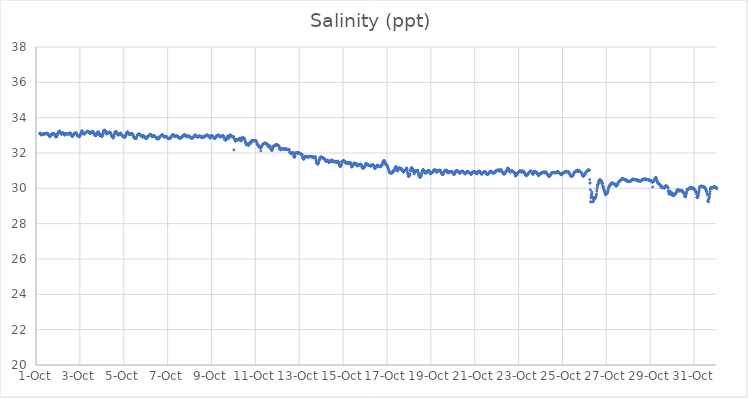
| Category | Salinity (ppt) |
|---|---|
| 44470.166666666664 | 33.1 |
| 44470.177083333336 | 33.11 |
| 44470.1875 | 33.12 |
| 44470.197916666664 | 33.13 |
| 44470.208333333336 | 33.09 |
| 44470.21875 | 33.04 |
| 44470.229166666664 | 33.02 |
| 44470.239583333336 | 33.02 |
| 44470.25 | 33.04 |
| 44470.260416666664 | 33.05 |
| 44470.270833333336 | 33.05 |
| 44470.28125 | 33.06 |
| 44470.291666666664 | 33.06 |
| 44470.302083333336 | 33.07 |
| 44470.3125 | 33.07 |
| 44470.322916666664 | 33.07 |
| 44470.333333333336 | 33.08 |
| 44470.34375 | 33.08 |
| 44470.354166666664 | 33.08 |
| 44470.364583333336 | 33.07 |
| 44470.375 | 33.08 |
| 44470.385416666664 | 33.08 |
| 44470.395833333336 | 33.09 |
| 44470.40625 | 33.1 |
| 44470.416666666664 | 33.09 |
| 44470.427083333336 | 33.1 |
| 44470.4375 | 33.1 |
| 44470.447916666664 | 33.09 |
| 44470.458333333336 | 33.1 |
| 44470.46875 | 33.08 |
| 44470.479166666664 | 33.12 |
| 44470.489583333336 | 33.11 |
| 44470.5 | 33.11 |
| 44470.510416666664 | 33.1 |
| 44470.520833333336 | 33.12 |
| 44470.53125 | 33.11 |
| 44470.541666666664 | 33.05 |
| 44470.552083333336 | 33.05 |
| 44470.5625 | 33.07 |
| 44470.572916666664 | 33.01 |
| 44470.583333333336 | 33 |
| 44470.59375 | 32.97 |
| 44470.604166666664 | 32.98 |
| 44470.614583333336 | 32.96 |
| 44470.625 | 32.92 |
| 44470.635416666664 | 32.99 |
| 44470.645833333336 | 32.96 |
| 44470.65625 | 33 |
| 44470.666666666664 | 32.96 |
| 44470.677083333336 | 32.96 |
| 44470.6875 | 33 |
| 44470.697916666664 | 33.03 |
| 44470.708333333336 | 33.06 |
| 44470.71875 | 33.08 |
| 44470.729166666664 | 33.04 |
| 44470.739583333336 | 33.05 |
| 44470.75 | 33.08 |
| 44470.760416666664 | 33.09 |
| 44470.770833333336 | 33.08 |
| 44470.78125 | 33.09 |
| 44470.791666666664 | 33.1 |
| 44470.802083333336 | 33.12 |
| 44470.8125 | 33.11 |
| 44470.822916666664 | 33.11 |
| 44470.833333333336 | 33.09 |
| 44470.84375 | 33.05 |
| 44470.854166666664 | 33.04 |
| 44470.864583333336 | 32.99 |
| 44470.875 | 32.97 |
| 44470.885416666664 | 32.94 |
| 44470.895833333336 | 32.91 |
| 44470.90625 | 32.92 |
| 44470.916666666664 | 32.92 |
| 44470.927083333336 | 32.92 |
| 44470.9375 | 32.93 |
| 44470.947916666664 | 32.92 |
| 44470.958333333336 | 33.01 |
| 44470.96875 | 33.01 |
| 44470.979166666664 | 33.1 |
| 44470.989583333336 | 33.09 |
| 44471.0 | 33.14 |
| 44471.010416666664 | 33.13 |
| 44471.020833333336 | 33.13 |
| 44471.03125 | 33.17 |
| 44471.041666666664 | 33.21 |
| 44471.052083333336 | 33.24 |
| 44471.0625 | 33.24 |
| 44471.072916666664 | 33.2 |
| 44471.083333333336 | 33.21 |
| 44471.09375 | 33.22 |
| 44471.104166666664 | 33.2 |
| 44471.114583333336 | 33.17 |
| 44471.125 | 33.14 |
| 44471.135416666664 | 33.09 |
| 44471.145833333336 | 33.07 |
| 44471.15625 | 33.06 |
| 44471.166666666664 | 33.06 |
| 44471.177083333336 | 33.13 |
| 44471.1875 | 33.09 |
| 44471.197916666664 | 33.13 |
| 44471.208333333336 | 33.1 |
| 44471.21875 | 33.11 |
| 44471.229166666664 | 33.12 |
| 44471.239583333336 | 33.13 |
| 44471.25 | 33.14 |
| 44471.260416666664 | 33.12 |
| 44471.270833333336 | 33.09 |
| 44471.28125 | 33.04 |
| 44471.291666666664 | 33.02 |
| 44471.302083333336 | 33.02 |
| 44471.3125 | 33.03 |
| 44471.322916666664 | 33.05 |
| 44471.333333333336 | 33.07 |
| 44471.34375 | 33.08 |
| 44471.354166666664 | 33.09 |
| 44471.364583333336 | 33.1 |
| 44471.375 | 33.09 |
| 44471.385416666664 | 33.09 |
| 44471.395833333336 | 33.08 |
| 44471.40625 | 33.09 |
| 44471.416666666664 | 33.08 |
| 44471.427083333336 | 33.09 |
| 44471.4375 | 33.08 |
| 44471.447916666664 | 33.08 |
| 44471.458333333336 | 33.08 |
| 44471.46875 | 33.08 |
| 44471.479166666664 | 33.1 |
| 44471.489583333336 | 33.09 |
| 44471.5 | 33.08 |
| 44471.510416666664 | 33.1 |
| 44471.520833333336 | 33.08 |
| 44471.53125 | 33.13 |
| 44471.541666666664 | 33.1 |
| 44471.552083333336 | 33.13 |
| 44471.5625 | 33.11 |
| 44471.572916666664 | 33.14 |
| 44471.583333333336 | 33.03 |
| 44471.59375 | 33.06 |
| 44471.604166666664 | 33.02 |
| 44471.614583333336 | 33.01 |
| 44471.625 | 32.98 |
| 44471.635416666664 | 32.95 |
| 44471.645833333336 | 32.97 |
| 44471.65625 | 32.97 |
| 44471.666666666664 | 32.93 |
| 44471.677083333336 | 33.02 |
| 44471.6875 | 32.99 |
| 44471.697916666664 | 32.98 |
| 44471.708333333336 | 33.04 |
| 44471.71875 | 33.04 |
| 44471.729166666664 | 33.04 |
| 44471.739583333336 | 33.1 |
| 44471.75 | 33.09 |
| 44471.760416666664 | 33.11 |
| 44471.770833333336 | 33.13 |
| 44471.78125 | 33.13 |
| 44471.791666666664 | 33.12 |
| 44471.802083333336 | 33.12 |
| 44471.8125 | 33.14 |
| 44471.822916666664 | 33.14 |
| 44471.833333333336 | 33.12 |
| 44471.84375 | 33.12 |
| 44471.854166666664 | 33.09 |
| 44471.864583333336 | 33.06 |
| 44471.875 | 33.04 |
| 44471.885416666664 | 32.98 |
| 44471.895833333336 | 33 |
| 44471.90625 | 32.97 |
| 44471.916666666664 | 32.96 |
| 44471.927083333336 | 32.96 |
| 44471.9375 | 32.93 |
| 44471.947916666664 | 32.95 |
| 44471.958333333336 | 32.94 |
| 44471.96875 | 32.95 |
| 44471.979166666664 | 32.91 |
| 44471.989583333336 | 32.98 |
| 44472.0 | 32.95 |
| 44472.010416666664 | 32.98 |
| 44472.020833333336 | 33.03 |
| 44472.03125 | 33.06 |
| 44472.041666666664 | 33.09 |
| 44472.052083333336 | 33.06 |
| 44472.0625 | 33.17 |
| 44472.072916666664 | 33.18 |
| 44472.083333333336 | 33.25 |
| 44472.09375 | 33.25 |
| 44472.104166666664 | 33.24 |
| 44472.114583333336 | 33.24 |
| 44472.125 | 33.18 |
| 44472.135416666664 | 33.18 |
| 44472.145833333336 | 33.14 |
| 44472.15625 | 33.1 |
| 44472.166666666664 | 33.1 |
| 44472.177083333336 | 33.07 |
| 44472.1875 | 33.07 |
| 44472.197916666664 | 33.08 |
| 44472.208333333336 | 33.11 |
| 44472.21875 | 33.12 |
| 44472.229166666664 | 33.11 |
| 44472.239583333336 | 33.11 |
| 44472.25 | 33.12 |
| 44472.260416666664 | 33.12 |
| 44472.270833333336 | 33.15 |
| 44472.28125 | 33.18 |
| 44472.291666666664 | 33.17 |
| 44472.302083333336 | 33.17 |
| 44472.3125 | 33.19 |
| 44472.322916666664 | 33.19 |
| 44472.333333333336 | 33.21 |
| 44472.34375 | 33.22 |
| 44472.354166666664 | 33.24 |
| 44472.364583333336 | 33.23 |
| 44472.375 | 33.23 |
| 44472.385416666664 | 33.22 |
| 44472.395833333336 | 33.21 |
| 44472.40625 | 33.2 |
| 44472.416666666664 | 33.18 |
| 44472.427083333336 | 33.17 |
| 44472.4375 | 33.14 |
| 44472.447916666664 | 33.11 |
| 44472.458333333336 | 33.13 |
| 44472.46875 | 33.1 |
| 44472.479166666664 | 33.1 |
| 44472.489583333336 | 33.12 |
| 44472.5 | 33.14 |
| 44472.510416666664 | 33.16 |
| 44472.520833333336 | 33.2 |
| 44472.53125 | 33.17 |
| 44472.541666666664 | 33.2 |
| 44472.552083333336 | 33.21 |
| 44472.5625 | 33.18 |
| 44472.572916666664 | 33.14 |
| 44472.583333333336 | 33.23 |
| 44472.59375 | 33.18 |
| 44472.604166666664 | 33.18 |
| 44472.614583333336 | 33.18 |
| 44472.625 | 33.16 |
| 44472.635416666664 | 33.16 |
| 44472.645833333336 | 33.1 |
| 44472.65625 | 33.11 |
| 44472.666666666664 | 33.09 |
| 44472.677083333336 | 32.99 |
| 44472.6875 | 33.01 |
| 44472.697916666664 | 32.98 |
| 44472.708333333336 | 33.01 |
| 44472.71875 | 33.04 |
| 44472.729166666664 | 32.98 |
| 44472.739583333336 | 33 |
| 44472.75 | 33.01 |
| 44472.760416666664 | 33.07 |
| 44472.770833333336 | 33.08 |
| 44472.78125 | 33.1 |
| 44472.791666666664 | 33.14 |
| 44472.802083333336 | 33.16 |
| 44472.8125 | 33.18 |
| 44472.822916666664 | 33.18 |
| 44472.833333333336 | 33.19 |
| 44472.84375 | 33.19 |
| 44472.854166666664 | 33.18 |
| 44472.864583333336 | 33.17 |
| 44472.875 | 33.11 |
| 44472.885416666664 | 33.09 |
| 44472.895833333336 | 33.07 |
| 44472.90625 | 32.98 |
| 44472.916666666664 | 33.04 |
| 44472.927083333336 | 33.01 |
| 44472.9375 | 32.98 |
| 44472.947916666664 | 32.96 |
| 44472.958333333336 | 32.98 |
| 44472.96875 | 32.96 |
| 44472.979166666664 | 32.96 |
| 44472.989583333336 | 32.96 |
| 44473.0 | 33.04 |
| 44473.010416666664 | 32.97 |
| 44473.020833333336 | 32.94 |
| 44473.03125 | 32.98 |
| 44473.041666666664 | 32.99 |
| 44473.052083333336 | 33.11 |
| 44473.0625 | 33.11 |
| 44473.072916666664 | 33.19 |
| 44473.083333333336 | 33.28 |
| 44473.09375 | 33.26 |
| 44473.104166666664 | 33.26 |
| 44473.114583333336 | 33.29 |
| 44473.125 | 33.27 |
| 44473.135416666664 | 33.29 |
| 44473.145833333336 | 33.25 |
| 44473.15625 | 33.26 |
| 44473.166666666664 | 33.24 |
| 44473.177083333336 | 33.18 |
| 44473.1875 | 33.17 |
| 44473.197916666664 | 33.13 |
| 44473.208333333336 | 33.09 |
| 44473.21875 | 33.08 |
| 44473.229166666664 | 33.09 |
| 44473.239583333336 | 33.13 |
| 44473.25 | 33.12 |
| 44473.260416666664 | 33.11 |
| 44473.270833333336 | 33.13 |
| 44473.28125 | 33.14 |
| 44473.291666666664 | 33.14 |
| 44473.302083333336 | 33.16 |
| 44473.3125 | 33.17 |
| 44473.322916666664 | 33.15 |
| 44473.333333333336 | 33.16 |
| 44473.34375 | 33.18 |
| 44473.354166666664 | 33.18 |
| 44473.364583333336 | 33.18 |
| 44473.375 | 33.16 |
| 44473.385416666664 | 33.16 |
| 44473.395833333336 | 33.16 |
| 44473.40625 | 33.13 |
| 44473.416666666664 | 33.11 |
| 44473.427083333336 | 33.04 |
| 44473.4375 | 32.99 |
| 44473.447916666664 | 32.96 |
| 44473.458333333336 | 32.93 |
| 44473.46875 | 32.94 |
| 44473.479166666664 | 32.91 |
| 44473.489583333336 | 32.91 |
| 44473.5 | 32.86 |
| 44473.510416666664 | 32.87 |
| 44473.520833333336 | 32.84 |
| 44473.53125 | 32.88 |
| 44473.541666666664 | 32.93 |
| 44473.552083333336 | 32.95 |
| 44473.5625 | 33.06 |
| 44473.572916666664 | 33.06 |
| 44473.583333333336 | 33.1 |
| 44473.59375 | 33.15 |
| 44473.604166666664 | 33.19 |
| 44473.614583333336 | 33.17 |
| 44473.625 | 33.22 |
| 44473.635416666664 | 33.21 |
| 44473.645833333336 | 33.22 |
| 44473.65625 | 33.2 |
| 44473.666666666664 | 33.18 |
| 44473.677083333336 | 33.17 |
| 44473.6875 | 33.16 |
| 44473.697916666664 | 33.11 |
| 44473.708333333336 | 33.08 |
| 44473.71875 | 33.05 |
| 44473.729166666664 | 33.04 |
| 44473.739583333336 | 33.01 |
| 44473.75 | 33.04 |
| 44473.760416666664 | 33.03 |
| 44473.770833333336 | 33.02 |
| 44473.78125 | 33.04 |
| 44473.791666666664 | 33.07 |
| 44473.802083333336 | 33.09 |
| 44473.8125 | 33.09 |
| 44473.822916666664 | 33.11 |
| 44473.833333333336 | 33.12 |
| 44473.84375 | 33.13 |
| 44473.854166666664 | 33.12 |
| 44473.864583333336 | 33.1 |
| 44473.875 | 33.09 |
| 44473.885416666664 | 33.08 |
| 44473.895833333336 | 33.05 |
| 44473.90625 | 33.02 |
| 44473.916666666664 | 32.99 |
| 44473.927083333336 | 32.98 |
| 44473.9375 | 32.97 |
| 44473.947916666664 | 32.95 |
| 44473.958333333336 | 32.93 |
| 44473.96875 | 32.91 |
| 44473.979166666664 | 32.93 |
| 44473.989583333336 | 32.93 |
| 44474.0 | 32.93 |
| 44474.010416666664 | 32.91 |
| 44474.020833333336 | 32.96 |
| 44474.03125 | 32.92 |
| 44474.041666666664 | 32.9 |
| 44474.052083333336 | 32.91 |
| 44474.0625 | 32.89 |
| 44474.072916666664 | 32.93 |
| 44474.083333333336 | 32.99 |
| 44474.09375 | 33.01 |
| 44474.104166666664 | 33.04 |
| 44474.114583333336 | 33.07 |
| 44474.125 | 33.11 |
| 44474.135416666664 | 33.15 |
| 44474.145833333336 | 33.18 |
| 44474.15625 | 33.17 |
| 44474.166666666664 | 33.2 |
| 44474.177083333336 | 33.14 |
| 44474.1875 | 33.18 |
| 44474.197916666664 | 33.16 |
| 44474.208333333336 | 33.15 |
| 44474.21875 | 33.12 |
| 44474.229166666664 | 33.1 |
| 44474.239583333336 | 33.08 |
| 44474.25 | 33.05 |
| 44474.260416666664 | 33.05 |
| 44474.270833333336 | 33.09 |
| 44474.28125 | 33.04 |
| 44474.291666666664 | 33.06 |
| 44474.302083333336 | 33.07 |
| 44474.3125 | 33.08 |
| 44474.322916666664 | 33.09 |
| 44474.333333333336 | 33.09 |
| 44474.34375 | 33.07 |
| 44474.354166666664 | 33.09 |
| 44474.364583333336 | 33.1 |
| 44474.375 | 33.11 |
| 44474.385416666664 | 33.1 |
| 44474.395833333336 | 33.08 |
| 44474.40625 | 33.06 |
| 44474.416666666664 | 33.04 |
| 44474.427083333336 | 32.99 |
| 44474.4375 | 32.95 |
| 44474.447916666664 | 32.91 |
| 44474.458333333336 | 32.9 |
| 44474.46875 | 32.85 |
| 44474.479166666664 | 32.85 |
| 44474.489583333336 | 32.85 |
| 44474.5 | 32.84 |
| 44474.510416666664 | 32.83 |
| 44474.520833333336 | 32.83 |
| 44474.53125 | 32.83 |
| 44474.541666666664 | 32.81 |
| 44474.552083333336 | 32.86 |
| 44474.5625 | 32.81 |
| 44474.572916666664 | 32.85 |
| 44474.583333333336 | 32.9 |
| 44474.59375 | 32.91 |
| 44474.604166666664 | 32.95 |
| 44474.614583333336 | 33.01 |
| 44474.625 | 33.03 |
| 44474.635416666664 | 33.03 |
| 44474.645833333336 | 33.05 |
| 44474.65625 | 33.04 |
| 44474.666666666664 | 33.05 |
| 44474.677083333336 | 33.06 |
| 44474.6875 | 33.08 |
| 44474.697916666664 | 33.07 |
| 44474.708333333336 | 33.07 |
| 44474.71875 | 33.05 |
| 44474.729166666664 | 33.06 |
| 44474.739583333336 | 33.03 |
| 44474.75 | 33.04 |
| 44474.760416666664 | 33.01 |
| 44474.770833333336 | 32.99 |
| 44474.78125 | 32.99 |
| 44474.791666666664 | 32.95 |
| 44474.802083333336 | 32.95 |
| 44474.8125 | 32.98 |
| 44474.822916666664 | 32.99 |
| 44474.833333333336 | 32.98 |
| 44474.84375 | 32.99 |
| 44474.854166666664 | 32.98 |
| 44474.864583333336 | 32.89 |
| 44474.875 | 32.99 |
| 44474.885416666664 | 32.99 |
| 44474.895833333336 | 32.98 |
| 44474.90625 | 32.98 |
| 44474.916666666664 | 32.97 |
| 44474.927083333336 | 32.95 |
| 44474.9375 | 32.92 |
| 44474.947916666664 | 32.89 |
| 44474.958333333336 | 32.88 |
| 44474.96875 | 32.86 |
| 44474.979166666664 | 32.85 |
| 44474.989583333336 | 32.83 |
| 44475.0 | 32.83 |
| 44475.010416666664 | 32.82 |
| 44475.020833333336 | 32.83 |
| 44475.03125 | 32.82 |
| 44475.041666666664 | 32.92 |
| 44475.052083333336 | 32.84 |
| 44475.0625 | 32.86 |
| 44475.072916666664 | 32.86 |
| 44475.083333333336 | 32.87 |
| 44475.09375 | 32.91 |
| 44475.104166666664 | 32.92 |
| 44475.114583333336 | 32.93 |
| 44475.125 | 32.96 |
| 44475.135416666664 | 32.99 |
| 44475.145833333336 | 32.99 |
| 44475.15625 | 33 |
| 44475.166666666664 | 33.01 |
| 44475.177083333336 | 33.04 |
| 44475.1875 | 33.05 |
| 44475.197916666664 | 33.04 |
| 44475.208333333336 | 33.05 |
| 44475.21875 | 33.06 |
| 44475.229166666664 | 33.05 |
| 44475.239583333336 | 33.04 |
| 44475.25 | 33.02 |
| 44475.260416666664 | 33.01 |
| 44475.270833333336 | 32.97 |
| 44475.28125 | 32.95 |
| 44475.291666666664 | 32.94 |
| 44475.302083333336 | 32.93 |
| 44475.3125 | 32.95 |
| 44475.322916666664 | 32.93 |
| 44475.333333333336 | 32.95 |
| 44475.34375 | 32.97 |
| 44475.354166666664 | 32.98 |
| 44475.364583333336 | 32.98 |
| 44475.375 | 32.97 |
| 44475.385416666664 | 32.98 |
| 44475.395833333336 | 32.98 |
| 44475.40625 | 32.97 |
| 44475.416666666664 | 32.95 |
| 44475.427083333336 | 32.95 |
| 44475.4375 | 32.94 |
| 44475.447916666664 | 32.92 |
| 44475.458333333336 | 32.89 |
| 44475.46875 | 32.87 |
| 44475.479166666664 | 32.85 |
| 44475.489583333336 | 32.83 |
| 44475.5 | 32.82 |
| 44475.510416666664 | 32.81 |
| 44475.520833333336 | 32.8 |
| 44475.53125 | 32.8 |
| 44475.541666666664 | 32.8 |
| 44475.552083333336 | 32.81 |
| 44475.5625 | 32.81 |
| 44475.572916666664 | 32.89 |
| 44475.583333333336 | 32.81 |
| 44475.59375 | 32.81 |
| 44475.604166666664 | 32.84 |
| 44475.614583333336 | 32.84 |
| 44475.625 | 32.88 |
| 44475.635416666664 | 32.9 |
| 44475.645833333336 | 32.92 |
| 44475.65625 | 32.94 |
| 44475.666666666664 | 32.95 |
| 44475.677083333336 | 32.95 |
| 44475.6875 | 32.97 |
| 44475.697916666664 | 32.98 |
| 44475.708333333336 | 33 |
| 44475.71875 | 33.01 |
| 44475.729166666664 | 33.02 |
| 44475.739583333336 | 33.03 |
| 44475.75 | 33.03 |
| 44475.760416666664 | 33 |
| 44475.770833333336 | 33.01 |
| 44475.78125 | 32.99 |
| 44475.791666666664 | 32.99 |
| 44475.802083333336 | 32.95 |
| 44475.8125 | 32.95 |
| 44475.822916666664 | 32.92 |
| 44475.833333333336 | 32.93 |
| 44475.84375 | 32.9 |
| 44475.854166666664 | 32.9 |
| 44475.864583333336 | 32.92 |
| 44475.875 | 32.93 |
| 44475.885416666664 | 32.95 |
| 44475.895833333336 | 32.94 |
| 44475.90625 | 32.93 |
| 44475.916666666664 | 32.94 |
| 44475.927083333336 | 32.95 |
| 44475.9375 | 32.94 |
| 44475.947916666664 | 32.92 |
| 44475.958333333336 | 32.9 |
| 44475.96875 | 32.9 |
| 44475.979166666664 | 32.89 |
| 44475.989583333336 | 32.87 |
| 44476.0 | 32.86 |
| 44476.010416666664 | 32.84 |
| 44476.020833333336 | 32.83 |
| 44476.03125 | 32.82 |
| 44476.041666666664 | 32.81 |
| 44476.052083333336 | 32.81 |
| 44476.0625 | 32.81 |
| 44476.072916666664 | 32.85 |
| 44476.083333333336 | 32.82 |
| 44476.09375 | 32.81 |
| 44476.104166666664 | 32.84 |
| 44476.114583333336 | 32.83 |
| 44476.125 | 32.84 |
| 44476.135416666664 | 32.85 |
| 44476.145833333336 | 32.88 |
| 44476.15625 | 32.9 |
| 44476.166666666664 | 32.93 |
| 44476.177083333336 | 32.96 |
| 44476.1875 | 32.99 |
| 44476.197916666664 | 33.01 |
| 44476.208333333336 | 32.99 |
| 44476.21875 | 33.01 |
| 44476.229166666664 | 33.02 |
| 44476.239583333336 | 33.03 |
| 44476.25 | 33.03 |
| 44476.260416666664 | 33.03 |
| 44476.270833333336 | 33.02 |
| 44476.28125 | 33 |
| 44476.291666666664 | 32.99 |
| 44476.302083333336 | 32.96 |
| 44476.3125 | 32.95 |
| 44476.322916666664 | 32.92 |
| 44476.333333333336 | 32.92 |
| 44476.34375 | 32.94 |
| 44476.354166666664 | 32.94 |
| 44476.364583333336 | 32.94 |
| 44476.375 | 32.96 |
| 44476.385416666664 | 32.97 |
| 44476.395833333336 | 32.97 |
| 44476.40625 | 32.97 |
| 44476.416666666664 | 32.96 |
| 44476.427083333336 | 32.97 |
| 44476.4375 | 32.97 |
| 44476.447916666664 | 32.94 |
| 44476.458333333336 | 32.93 |
| 44476.46875 | 32.92 |
| 44476.479166666664 | 32.91 |
| 44476.489583333336 | 32.9 |
| 44476.5 | 32.88 |
| 44476.510416666664 | 32.86 |
| 44476.520833333336 | 32.85 |
| 44476.53125 | 32.83 |
| 44476.541666666664 | 32.83 |
| 44476.552083333336 | 32.83 |
| 44476.5625 | 32.84 |
| 44476.572916666664 | 32.85 |
| 44476.583333333336 | 32.85 |
| 44476.59375 | 32.86 |
| 44476.604166666664 | 32.86 |
| 44476.614583333336 | 32.86 |
| 44476.625 | 32.86 |
| 44476.635416666664 | 32.88 |
| 44476.645833333336 | 32.9 |
| 44476.65625 | 32.92 |
| 44476.666666666664 | 32.93 |
| 44476.677083333336 | 32.93 |
| 44476.6875 | 32.94 |
| 44476.697916666664 | 32.96 |
| 44476.708333333336 | 32.98 |
| 44476.71875 | 32.97 |
| 44476.729166666664 | 33 |
| 44476.739583333336 | 33.01 |
| 44476.75 | 33.03 |
| 44476.760416666664 | 33.02 |
| 44476.770833333336 | 32.98 |
| 44476.78125 | 33.03 |
| 44476.791666666664 | 33.02 |
| 44476.802083333336 | 33.01 |
| 44476.8125 | 32.98 |
| 44476.822916666664 | 32.98 |
| 44476.833333333336 | 32.95 |
| 44476.84375 | 32.97 |
| 44476.854166666664 | 32.95 |
| 44476.864583333336 | 32.95 |
| 44476.875 | 32.92 |
| 44476.885416666664 | 32.91 |
| 44476.895833333336 | 32.92 |
| 44476.90625 | 32.94 |
| 44476.916666666664 | 32.96 |
| 44476.927083333336 | 32.96 |
| 44476.9375 | 32.95 |
| 44476.947916666664 | 32.96 |
| 44476.958333333336 | 32.97 |
| 44476.96875 | 32.97 |
| 44476.979166666664 | 32.94 |
| 44476.989583333336 | 32.93 |
| 44477.0 | 32.93 |
| 44477.010416666664 | 32.93 |
| 44477.020833333336 | 32.92 |
| 44477.03125 | 32.9 |
| 44477.041666666664 | 32.88 |
| 44477.052083333336 | 32.87 |
| 44477.0625 | 32.85 |
| 44477.072916666664 | 32.84 |
| 44477.083333333336 | 32.84 |
| 44477.09375 | 32.84 |
| 44477.104166666664 | 32.84 |
| 44477.114583333336 | 32.84 |
| 44477.125 | 32.84 |
| 44477.135416666664 | 32.84 |
| 44477.145833333336 | 32.87 |
| 44477.15625 | 32.86 |
| 44477.166666666664 | 32.89 |
| 44477.177083333336 | 32.9 |
| 44477.1875 | 32.92 |
| 44477.197916666664 | 32.93 |
| 44477.208333333336 | 32.97 |
| 44477.21875 | 32.98 |
| 44477.229166666664 | 33 |
| 44477.239583333336 | 32.93 |
| 44477.25 | 32.99 |
| 44477.260416666664 | 32.93 |
| 44477.270833333336 | 33.03 |
| 44477.28125 | 33.01 |
| 44477.291666666664 | 32.99 |
| 44477.302083333336 | 32.95 |
| 44477.3125 | 32.97 |
| 44477.322916666664 | 32.95 |
| 44477.333333333336 | 32.93 |
| 44477.34375 | 32.91 |
| 44477.354166666664 | 32.9 |
| 44477.364583333336 | 32.91 |
| 44477.375 | 32.91 |
| 44477.385416666664 | 32.9 |
| 44477.395833333336 | 32.91 |
| 44477.40625 | 32.93 |
| 44477.416666666664 | 32.95 |
| 44477.427083333336 | 32.96 |
| 44477.4375 | 32.96 |
| 44477.447916666664 | 32.96 |
| 44477.458333333336 | 32.96 |
| 44477.46875 | 32.96 |
| 44477.479166666664 | 32.95 |
| 44477.489583333336 | 32.95 |
| 44477.5 | 32.94 |
| 44477.510416666664 | 32.93 |
| 44477.520833333336 | 32.92 |
| 44477.53125 | 32.9 |
| 44477.541666666664 | 32.88 |
| 44477.552083333336 | 32.87 |
| 44477.5625 | 32.86 |
| 44477.572916666664 | 32.87 |
| 44477.583333333336 | 32.89 |
| 44477.59375 | 32.9 |
| 44477.604166666664 | 32.9 |
| 44477.614583333336 | 32.92 |
| 44477.625 | 32.92 |
| 44477.635416666664 | 32.92 |
| 44477.645833333336 | 32.91 |
| 44477.65625 | 32.9 |
| 44477.666666666664 | 32.92 |
| 44477.677083333336 | 32.92 |
| 44477.6875 | 32.92 |
| 44477.697916666664 | 32.93 |
| 44477.708333333336 | 32.94 |
| 44477.71875 | 32.98 |
| 44477.729166666664 | 32.97 |
| 44477.739583333336 | 33 |
| 44477.75 | 32.97 |
| 44477.760416666664 | 33.01 |
| 44477.770833333336 | 33 |
| 44477.78125 | 33.02 |
| 44477.791666666664 | 33.03 |
| 44477.802083333336 | 32.98 |
| 44477.8125 | 33 |
| 44477.822916666664 | 32.98 |
| 44477.833333333336 | 33.01 |
| 44477.84375 | 33 |
| 44477.854166666664 | 32.97 |
| 44477.864583333336 | 32.94 |
| 44477.875 | 32.98 |
| 44477.885416666664 | 32.94 |
| 44477.895833333336 | 32.94 |
| 44477.90625 | 32.92 |
| 44477.916666666664 | 32.9 |
| 44477.927083333336 | 32.93 |
| 44477.9375 | 32.83 |
| 44477.947916666664 | 32.96 |
| 44477.958333333336 | 32.96 |
| 44477.96875 | 32.96 |
| 44477.979166666664 | 32.96 |
| 44477.989583333336 | 32.97 |
| 44478.0 | 32.97 |
| 44478.010416666664 | 32.96 |
| 44478.020833333336 | 32.95 |
| 44478.03125 | 32.96 |
| 44478.041666666664 | 32.96 |
| 44478.052083333336 | 32.96 |
| 44478.0625 | 32.95 |
| 44478.072916666664 | 32.92 |
| 44478.083333333336 | 32.89 |
| 44478.09375 | 32.87 |
| 44478.104166666664 | 32.86 |
| 44478.114583333336 | 32.85 |
| 44478.125 | 32.83 |
| 44478.135416666664 | 32.82 |
| 44478.145833333336 | 32.87 |
| 44478.15625 | 32.83 |
| 44478.166666666664 | 32.83 |
| 44478.177083333336 | 32.84 |
| 44478.1875 | 32.86 |
| 44478.197916666664 | 32.89 |
| 44478.208333333336 | 32.92 |
| 44478.21875 | 32.95 |
| 44478.229166666664 | 32.98 |
| 44478.239583333336 | 32.98 |
| 44478.25 | 32.99 |
| 44478.260416666664 | 32.99 |
| 44478.270833333336 | 32.99 |
| 44478.28125 | 32.99 |
| 44478.291666666664 | 33.01 |
| 44478.302083333336 | 33.02 |
| 44478.3125 | 33.01 |
| 44478.322916666664 | 33.02 |
| 44478.333333333336 | 32.99 |
| 44478.34375 | 32.98 |
| 44478.354166666664 | 32.97 |
| 44478.364583333336 | 32.94 |
| 44478.375 | 32.92 |
| 44478.385416666664 | 32.92 |
| 44478.395833333336 | 32.93 |
| 44478.40625 | 32.92 |
| 44478.416666666664 | 32.91 |
| 44478.427083333336 | 32.92 |
| 44478.4375 | 32.94 |
| 44478.447916666664 | 32.95 |
| 44478.458333333336 | 32.97 |
| 44478.46875 | 32.96 |
| 44478.479166666664 | 32.96 |
| 44478.489583333336 | 32.96 |
| 44478.5 | 32.97 |
| 44478.510416666664 | 32.98 |
| 44478.520833333336 | 32.97 |
| 44478.53125 | 32.97 |
| 44478.541666666664 | 32.96 |
| 44478.552083333336 | 32.96 |
| 44478.5625 | 32.94 |
| 44478.572916666664 | 32.88 |
| 44478.583333333336 | 32.84 |
| 44478.59375 | 32.77 |
| 44478.604166666664 | 32.77 |
| 44478.614583333336 | 32.76 |
| 44478.625 | 32.73 |
| 44478.635416666664 | 32.75 |
| 44478.645833333336 | 32.72 |
| 44478.65625 | 32.73 |
| 44478.666666666664 | 32.75 |
| 44478.677083333336 | 32.77 |
| 44478.6875 | 32.83 |
| 44478.697916666664 | 32.83 |
| 44478.708333333336 | 32.87 |
| 44478.71875 | 32.9 |
| 44478.729166666664 | 32.93 |
| 44478.739583333336 | 32.96 |
| 44478.75 | 32.83 |
| 44478.760416666664 | 32.95 |
| 44478.770833333336 | 32.89 |
| 44478.78125 | 32.96 |
| 44478.791666666664 | 32.83 |
| 44478.802083333336 | 32.91 |
| 44478.8125 | 32.95 |
| 44478.822916666664 | 32.98 |
| 44478.833333333336 | 32.93 |
| 44478.84375 | 32.99 |
| 44478.854166666664 | 33.03 |
| 44478.864583333336 | 33.01 |
| 44478.875 | 33.02 |
| 44478.885416666664 | 32.99 |
| 44478.895833333336 | 32.95 |
| 44478.90625 | 32.94 |
| 44478.916666666664 | 32.96 |
| 44478.927083333336 | 32.96 |
| 44478.9375 | 32.93 |
| 44478.947916666664 | 32.94 |
| 44478.958333333336 | 32.94 |
| 44478.96875 | 32.93 |
| 44478.979166666664 | 32.93 |
| 44478.989583333336 | 32.92 |
| 44479.0 | 32.94 |
| 44479.010416666664 | 32.91 |
| 44479.020833333336 | 32.18 |
| 44479.03125 | 32.83 |
| 44479.041666666664 | 32.82 |
| 44479.052083333336 | 32.8 |
| 44479.0625 | 32.77 |
| 44479.072916666664 | 32.71 |
| 44479.083333333336 | 32.69 |
| 44479.09375 | 32.67 |
| 44479.104166666664 | 32.68 |
| 44479.114583333336 | 32.71 |
| 44479.125 | 32.77 |
| 44479.135416666664 | 32.76 |
| 44479.145833333336 | 32.76 |
| 44479.15625 | 32.76 |
| 44479.166666666664 | 32.74 |
| 44479.177083333336 | 32.76 |
| 44479.1875 | 32.75 |
| 44479.197916666664 | 32.73 |
| 44479.208333333336 | 32.75 |
| 44479.21875 | 32.74 |
| 44479.229166666664 | 32.76 |
| 44479.239583333336 | 32.78 |
| 44479.25 | 32.8 |
| 44479.260416666664 | 32.81 |
| 44479.270833333336 | 32.8 |
| 44479.28125 | 32.77 |
| 44479.291666666664 | 32.8 |
| 44479.302083333336 | 32.84 |
| 44479.3125 | 32.82 |
| 44479.322916666664 | 32.69 |
| 44479.333333333336 | 32.77 |
| 44479.34375 | 32.69 |
| 44479.354166666664 | 32.77 |
| 44479.364583333336 | 32.81 |
| 44479.375 | 32.7 |
| 44479.385416666664 | 32.81 |
| 44479.395833333336 | 32.88 |
| 44479.40625 | 32.82 |
| 44479.416666666664 | 32.84 |
| 44479.427083333336 | 32.87 |
| 44479.4375 | 32.87 |
| 44479.447916666664 | 32.84 |
| 44479.458333333336 | 32.85 |
| 44479.46875 | 32.85 |
| 44479.479166666664 | 32.84 |
| 44479.489583333336 | 32.84 |
| 44479.5 | 32.82 |
| 44479.510416666664 | 32.8 |
| 44479.520833333336 | 32.74 |
| 44479.53125 | 32.68 |
| 44479.541666666664 | 32.64 |
| 44479.552083333336 | 32.63 |
| 44479.5625 | 32.55 |
| 44479.572916666664 | 32.53 |
| 44479.583333333336 | 32.49 |
| 44479.59375 | 32.45 |
| 44479.604166666664 | 32.48 |
| 44479.614583333336 | 32.5 |
| 44479.625 | 32.51 |
| 44479.635416666664 | 32.51 |
| 44479.645833333336 | 32.52 |
| 44479.65625 | 32.51 |
| 44479.666666666664 | 32.46 |
| 44479.677083333336 | 32.46 |
| 44479.6875 | 32.43 |
| 44479.697916666664 | 32.45 |
| 44479.708333333336 | 32.46 |
| 44479.71875 | 32.53 |
| 44479.729166666664 | 32.55 |
| 44479.739583333336 | 32.56 |
| 44479.75 | 32.58 |
| 44479.760416666664 | 32.58 |
| 44479.770833333336 | 32.6 |
| 44479.78125 | 32.61 |
| 44479.791666666664 | 32.54 |
| 44479.802083333336 | 32.65 |
| 44479.8125 | 32.67 |
| 44479.822916666664 | 32.67 |
| 44479.833333333336 | 32.7 |
| 44479.84375 | 32.71 |
| 44479.854166666664 | 32.71 |
| 44479.864583333336 | 32.68 |
| 44479.875 | 32.7 |
| 44479.885416666664 | 32.7 |
| 44479.895833333336 | 32.66 |
| 44479.90625 | 32.7 |
| 44479.916666666664 | 32.69 |
| 44479.927083333336 | 32.71 |
| 44479.9375 | 32.72 |
| 44479.947916666664 | 32.71 |
| 44479.958333333336 | 32.71 |
| 44479.96875 | 32.72 |
| 44479.979166666664 | 32.7 |
| 44479.989583333336 | 32.71 |
| 44480.0 | 32.7 |
| 44480.010416666664 | 32.7 |
| 44480.020833333336 | 32.69 |
| 44480.03125 | 32.69 |
| 44480.041666666664 | 32.67 |
| 44480.052083333336 | 32.62 |
| 44480.0625 | 32.59 |
| 44480.072916666664 | 32.56 |
| 44480.083333333336 | 32.49 |
| 44480.09375 | 32.46 |
| 44480.104166666664 | 32.46 |
| 44480.114583333336 | 32.47 |
| 44480.125 | 32.46 |
| 44480.135416666664 | 32.43 |
| 44480.145833333336 | 32.39 |
| 44480.15625 | 32.37 |
| 44480.166666666664 | 32.35 |
| 44480.177083333336 | 32.34 |
| 44480.1875 | 32.33 |
| 44480.197916666664 | 32.31 |
| 44480.208333333336 | 32.3 |
| 44480.21875 | 32.29 |
| 44480.229166666664 | 32.29 |
| 44480.239583333336 | 32.28 |
| 44480.25 | 32.12 |
| 44480.260416666664 | 32.3 |
| 44480.270833333336 | 32.31 |
| 44480.28125 | 32.35 |
| 44480.291666666664 | 32.4 |
| 44480.302083333336 | 32.42 |
| 44480.3125 | 32.44 |
| 44480.322916666664 | 32.43 |
| 44480.333333333336 | 32.47 |
| 44480.34375 | 32.51 |
| 44480.354166666664 | 32.5 |
| 44480.364583333336 | 32.51 |
| 44480.375 | 32.51 |
| 44480.385416666664 | 32.55 |
| 44480.395833333336 | 32.54 |
| 44480.40625 | 32.54 |
| 44480.416666666664 | 32.55 |
| 44480.427083333336 | 32.57 |
| 44480.4375 | 32.53 |
| 44480.447916666664 | 32.53 |
| 44480.458333333336 | 32.55 |
| 44480.46875 | 32.55 |
| 44480.479166666664 | 32.53 |
| 44480.489583333336 | 32.53 |
| 44480.5 | 32.54 |
| 44480.510416666664 | 32.53 |
| 44480.520833333336 | 32.52 |
| 44480.53125 | 32.51 |
| 44480.541666666664 | 32.5 |
| 44480.552083333336 | 32.44 |
| 44480.5625 | 32.41 |
| 44480.572916666664 | 32.41 |
| 44480.583333333336 | 32.38 |
| 44480.59375 | 32.36 |
| 44480.604166666664 | 32.35 |
| 44480.614583333336 | 32.36 |
| 44480.625 | 32.37 |
| 44480.635416666664 | 32.39 |
| 44480.645833333336 | 32.4 |
| 44480.65625 | 32.41 |
| 44480.666666666664 | 32.39 |
| 44480.677083333336 | 32.35 |
| 44480.6875 | 32.31 |
| 44480.697916666664 | 32.25 |
| 44480.708333333336 | 32.21 |
| 44480.71875 | 32.17 |
| 44480.729166666664 | 32.17 |
| 44480.739583333336 | 32.16 |
| 44480.75 | 32.15 |
| 44480.760416666664 | 32.14 |
| 44480.770833333336 | 32.21 |
| 44480.78125 | 32.23 |
| 44480.791666666664 | 32.29 |
| 44480.802083333336 | 32.33 |
| 44480.8125 | 32.31 |
| 44480.822916666664 | 32.36 |
| 44480.833333333336 | 32.39 |
| 44480.84375 | 32.4 |
| 44480.854166666664 | 32.4 |
| 44480.864583333336 | 32.41 |
| 44480.875 | 32.41 |
| 44480.885416666664 | 32.42 |
| 44480.895833333336 | 32.41 |
| 44480.90625 | 32.42 |
| 44480.916666666664 | 32.44 |
| 44480.927083333336 | 32.45 |
| 44480.9375 | 32.49 |
| 44480.947916666664 | 32.47 |
| 44480.958333333336 | 32.47 |
| 44480.96875 | 32.45 |
| 44480.979166666664 | 32.46 |
| 44480.989583333336 | 32.45 |
| 44481.0 | 32.46 |
| 44481.010416666664 | 32.46 |
| 44481.020833333336 | 32.44 |
| 44481.03125 | 32.44 |
| 44481.041666666664 | 32.43 |
| 44481.052083333336 | 32.42 |
| 44481.0625 | 32.41 |
| 44481.072916666664 | 32.38 |
| 44481.083333333336 | 32.36 |
| 44481.09375 | 32.36 |
| 44481.104166666664 | 32.27 |
| 44481.114583333336 | 32.21 |
| 44481.125 | 32.21 |
| 44481.135416666664 | 32.21 |
| 44481.145833333336 | 32.19 |
| 44481.15625 | 32.18 |
| 44481.166666666664 | 32.19 |
| 44481.177083333336 | 32.2 |
| 44481.1875 | 32.21 |
| 44481.197916666664 | 32.23 |
| 44481.208333333336 | 32.24 |
| 44481.21875 | 32.24 |
| 44481.229166666664 | 32.24 |
| 44481.239583333336 | 32.26 |
| 44481.25 | 32.24 |
| 44481.260416666664 | 32.24 |
| 44481.270833333336 | 32.24 |
| 44481.28125 | 32.23 |
| 44481.291666666664 | 32.21 |
| 44481.302083333336 | 32.22 |
| 44481.3125 | 32.22 |
| 44481.322916666664 | 32.22 |
| 44481.333333333336 | 32.21 |
| 44481.34375 | 32.22 |
| 44481.354166666664 | 32.22 |
| 44481.364583333336 | 32.21 |
| 44481.375 | 32.21 |
| 44481.385416666664 | 32.23 |
| 44481.395833333336 | 32.23 |
| 44481.40625 | 32.23 |
| 44481.416666666664 | 32.22 |
| 44481.427083333336 | 32.22 |
| 44481.4375 | 32.2 |
| 44481.447916666664 | 32.2 |
| 44481.458333333336 | 32.2 |
| 44481.46875 | 32.19 |
| 44481.479166666664 | 32.2 |
| 44481.489583333336 | 32.2 |
| 44481.5 | 32.2 |
| 44481.510416666664 | 32.2 |
| 44481.520833333336 | 32.19 |
| 44481.53125 | 32.19 |
| 44481.541666666664 | 32.19 |
| 44481.552083333336 | 32.19 |
| 44481.5625 | 32.05 |
| 44481.572916666664 | 32.03 |
| 44481.583333333336 | 32.04 |
| 44481.59375 | 32.01 |
| 44481.604166666664 | 32 |
| 44481.614583333336 | 31.98 |
| 44481.625 | 31.97 |
| 44481.635416666664 | 31.97 |
| 44481.645833333336 | 31.97 |
| 44481.65625 | 31.97 |
| 44481.666666666664 | 31.99 |
| 44481.677083333336 | 32 |
| 44481.6875 | 32.02 |
| 44481.697916666664 | 32.02 |
| 44481.708333333336 | 32.04 |
| 44481.71875 | 32.03 |
| 44481.729166666664 | 31.99 |
| 44481.739583333336 | 31.9 |
| 44481.75 | 31.82 |
| 44481.760416666664 | 31.79 |
| 44481.770833333336 | 31.76 |
| 44481.78125 | 31.76 |
| 44481.791666666664 | 31.76 |
| 44481.802083333336 | 31.81 |
| 44481.8125 | 31.88 |
| 44481.822916666664 | 31.98 |
| 44481.833333333336 | 32.01 |
| 44481.84375 | 32.01 |
| 44481.854166666664 | 32.02 |
| 44481.864583333336 | 32.01 |
| 44481.875 | 32.02 |
| 44481.885416666664 | 32.02 |
| 44481.895833333336 | 32.02 |
| 44481.90625 | 32 |
| 44481.916666666664 | 32.01 |
| 44481.927083333336 | 32 |
| 44481.9375 | 32.02 |
| 44481.947916666664 | 32.01 |
| 44481.958333333336 | 32.01 |
| 44481.96875 | 32.01 |
| 44481.979166666664 | 32.01 |
| 44481.989583333336 | 32 |
| 44482.0 | 32 |
| 44482.010416666664 | 31.98 |
| 44482.020833333336 | 31.98 |
| 44482.03125 | 31.99 |
| 44482.041666666664 | 31.97 |
| 44482.052083333336 | 31.96 |
| 44482.0625 | 31.95 |
| 44482.072916666664 | 31.96 |
| 44482.083333333336 | 31.93 |
| 44482.09375 | 31.93 |
| 44482.104166666664 | 31.92 |
| 44482.114583333336 | 31.91 |
| 44482.125 | 31.9 |
| 44482.135416666664 | 31.9 |
| 44482.145833333336 | 31.81 |
| 44482.15625 | 31.72 |
| 44482.166666666664 | 31.71 |
| 44482.177083333336 | 31.69 |
| 44482.1875 | 31.66 |
| 44482.197916666664 | 31.65 |
| 44482.208333333336 | 31.65 |
| 44482.21875 | 31.67 |
| 44482.229166666664 | 31.7 |
| 44482.239583333336 | 31.74 |
| 44482.25 | 31.76 |
| 44482.260416666664 | 31.79 |
| 44482.270833333336 | 31.81 |
| 44482.28125 | 31.81 |
| 44482.291666666664 | 31.8 |
| 44482.302083333336 | 31.81 |
| 44482.3125 | 31.82 |
| 44482.322916666664 | 31.81 |
| 44482.333333333336 | 31.8 |
| 44482.34375 | 31.79 |
| 44482.354166666664 | 31.8 |
| 44482.364583333336 | 31.77 |
| 44482.375 | 31.76 |
| 44482.385416666664 | 31.76 |
| 44482.395833333336 | 31.77 |
| 44482.40625 | 31.78 |
| 44482.416666666664 | 31.78 |
| 44482.427083333336 | 31.79 |
| 44482.4375 | 31.79 |
| 44482.447916666664 | 31.78 |
| 44482.458333333336 | 31.79 |
| 44482.46875 | 31.8 |
| 44482.479166666664 | 31.8 |
| 44482.489583333336 | 31.82 |
| 44482.5 | 31.8 |
| 44482.510416666664 | 31.8 |
| 44482.520833333336 | 31.82 |
| 44482.53125 | 31.8 |
| 44482.541666666664 | 31.79 |
| 44482.552083333336 | 31.78 |
| 44482.5625 | 31.79 |
| 44482.572916666664 | 31.79 |
| 44482.583333333336 | 31.79 |
| 44482.59375 | 31.79 |
| 44482.604166666664 | 31.78 |
| 44482.614583333336 | 31.78 |
| 44482.625 | 31.79 |
| 44482.635416666664 | 31.77 |
| 44482.645833333336 | 31.74 |
| 44482.65625 | 31.76 |
| 44482.666666666664 | 31.75 |
| 44482.677083333336 | 31.74 |
| 44482.6875 | 31.74 |
| 44482.697916666664 | 31.75 |
| 44482.708333333336 | 31.77 |
| 44482.71875 | 31.78 |
| 44482.729166666664 | 31.79 |
| 44482.739583333336 | 31.75 |
| 44482.75 | 31.69 |
| 44482.760416666664 | 31.61 |
| 44482.770833333336 | 31.54 |
| 44482.78125 | 31.5 |
| 44482.791666666664 | 31.42 |
| 44482.802083333336 | 31.41 |
| 44482.8125 | 31.39 |
| 44482.822916666664 | 31.39 |
| 44482.833333333336 | 31.39 |
| 44482.84375 | 31.36 |
| 44482.854166666664 | 31.4 |
| 44482.864583333336 | 31.4 |
| 44482.875 | 31.46 |
| 44482.885416666664 | 31.45 |
| 44482.895833333336 | 31.53 |
| 44482.90625 | 31.57 |
| 44482.916666666664 | 31.62 |
| 44482.927083333336 | 31.63 |
| 44482.9375 | 31.7 |
| 44482.947916666664 | 31.76 |
| 44482.958333333336 | 31.7 |
| 44482.96875 | 31.73 |
| 44482.979166666664 | 31.78 |
| 44482.989583333336 | 31.75 |
| 44483.0 | 31.74 |
| 44483.010416666664 | 31.76 |
| 44483.020833333336 | 31.76 |
| 44483.03125 | 31.78 |
| 44483.041666666664 | 31.75 |
| 44483.052083333336 | 31.72 |
| 44483.0625 | 31.72 |
| 44483.072916666664 | 31.72 |
| 44483.083333333336 | 31.71 |
| 44483.09375 | 31.67 |
| 44483.104166666664 | 31.71 |
| 44483.114583333336 | 31.7 |
| 44483.125 | 31.7 |
| 44483.135416666664 | 31.68 |
| 44483.145833333336 | 31.68 |
| 44483.15625 | 31.67 |
| 44483.166666666664 | 31.67 |
| 44483.177083333336 | 31.65 |
| 44483.1875 | 31.61 |
| 44483.197916666664 | 31.55 |
| 44483.208333333336 | 31.53 |
| 44483.21875 | 31.54 |
| 44483.229166666664 | 31.55 |
| 44483.239583333336 | 31.55 |
| 44483.25 | 31.55 |
| 44483.260416666664 | 31.55 |
| 44483.270833333336 | 31.56 |
| 44483.28125 | 31.58 |
| 44483.291666666664 | 31.59 |
| 44483.302083333336 | 31.58 |
| 44483.3125 | 31.56 |
| 44483.322916666664 | 31.52 |
| 44483.333333333336 | 31.5 |
| 44483.34375 | 31.46 |
| 44483.354166666664 | 31.47 |
| 44483.364583333336 | 31.46 |
| 44483.375 | 31.48 |
| 44483.385416666664 | 31.5 |
| 44483.395833333336 | 31.52 |
| 44483.40625 | 31.53 |
| 44483.416666666664 | 31.52 |
| 44483.427083333336 | 31.57 |
| 44483.4375 | 31.58 |
| 44483.447916666664 | 31.59 |
| 44483.458333333336 | 31.61 |
| 44483.46875 | 31.59 |
| 44483.479166666664 | 31.56 |
| 44483.489583333336 | 31.5 |
| 44483.5 | 31.51 |
| 44483.510416666664 | 31.52 |
| 44483.520833333336 | 31.53 |
| 44483.53125 | 31.55 |
| 44483.541666666664 | 31.57 |
| 44483.552083333336 | 31.53 |
| 44483.5625 | 31.53 |
| 44483.572916666664 | 31.53 |
| 44483.583333333336 | 31.51 |
| 44483.59375 | 31.49 |
| 44483.604166666664 | 31.49 |
| 44483.614583333336 | 31.5 |
| 44483.625 | 31.51 |
| 44483.635416666664 | 31.51 |
| 44483.645833333336 | 31.51 |
| 44483.65625 | 31.52 |
| 44483.666666666664 | 31.52 |
| 44483.677083333336 | 31.51 |
| 44483.6875 | 31.48 |
| 44483.697916666664 | 31.47 |
| 44483.708333333336 | 31.48 |
| 44483.71875 | 31.49 |
| 44483.729166666664 | 31.5 |
| 44483.739583333336 | 31.5 |
| 44483.75 | 31.53 |
| 44483.760416666664 | 31.54 |
| 44483.770833333336 | 31.53 |
| 44483.78125 | 31.51 |
| 44483.791666666664 | 31.47 |
| 44483.802083333336 | 31.43 |
| 44483.8125 | 31.4 |
| 44483.822916666664 | 31.36 |
| 44483.833333333336 | 31.33 |
| 44483.84375 | 31.31 |
| 44483.854166666664 | 31.26 |
| 44483.864583333336 | 31.23 |
| 44483.875 | 31.23 |
| 44483.885416666664 | 31.25 |
| 44483.895833333336 | 31.27 |
| 44483.90625 | 31.29 |
| 44483.916666666664 | 31.32 |
| 44483.927083333336 | 31.38 |
| 44483.9375 | 31.5 |
| 44483.947916666664 | 31.5 |
| 44483.958333333336 | 31.52 |
| 44483.96875 | 31.54 |
| 44483.979166666664 | 31.54 |
| 44483.989583333336 | 31.55 |
| 44484.0 | 31.55 |
| 44484.010416666664 | 31.56 |
| 44484.020833333336 | 31.58 |
| 44484.03125 | 31.56 |
| 44484.041666666664 | 31.54 |
| 44484.052083333336 | 31.55 |
| 44484.0625 | 31.53 |
| 44484.072916666664 | 31.52 |
| 44484.083333333336 | 31.48 |
| 44484.09375 | 31.51 |
| 44484.104166666664 | 31.51 |
| 44484.114583333336 | 31.49 |
| 44484.125 | 31.42 |
| 44484.135416666664 | 31.41 |
| 44484.145833333336 | 31.46 |
| 44484.15625 | 31.47 |
| 44484.166666666664 | 31.45 |
| 44484.177083333336 | 31.44 |
| 44484.1875 | 31.44 |
| 44484.197916666664 | 31.44 |
| 44484.208333333336 | 31.46 |
| 44484.21875 | 31.45 |
| 44484.229166666664 | 31.4 |
| 44484.239583333336 | 31.39 |
| 44484.25 | 31.41 |
| 44484.260416666664 | 31.43 |
| 44484.270833333336 | 31.43 |
| 44484.28125 | 31.44 |
| 44484.291666666664 | 31.46 |
| 44484.302083333336 | 31.47 |
| 44484.3125 | 31.47 |
| 44484.322916666664 | 31.46 |
| 44484.333333333336 | 31.45 |
| 44484.34375 | 31.44 |
| 44484.354166666664 | 31.39 |
| 44484.364583333336 | 31.36 |
| 44484.375 | 31.27 |
| 44484.385416666664 | 31.22 |
| 44484.395833333336 | 31.21 |
| 44484.40625 | 31.23 |
| 44484.416666666664 | 31.22 |
| 44484.427083333336 | 31.25 |
| 44484.4375 | 31.29 |
| 44484.447916666664 | 31.33 |
| 44484.458333333336 | 31.37 |
| 44484.46875 | 31.37 |
| 44484.479166666664 | 31.4 |
| 44484.489583333336 | 31.42 |
| 44484.5 | 31.43 |
| 44484.510416666664 | 31.43 |
| 44484.520833333336 | 31.41 |
| 44484.53125 | 31.36 |
| 44484.541666666664 | 31.36 |
| 44484.552083333336 | 31.37 |
| 44484.5625 | 31.39 |
| 44484.572916666664 | 31.41 |
| 44484.583333333336 | 31.38 |
| 44484.59375 | 31.38 |
| 44484.604166666664 | 31.39 |
| 44484.614583333336 | 31.34 |
| 44484.625 | 31.33 |
| 44484.635416666664 | 31.26 |
| 44484.645833333336 | 31.27 |
| 44484.65625 | 31.33 |
| 44484.666666666664 | 31.33 |
| 44484.677083333336 | 31.31 |
| 44484.6875 | 31.33 |
| 44484.697916666664 | 31.35 |
| 44484.708333333336 | 31.35 |
| 44484.71875 | 31.34 |
| 44484.729166666664 | 31.33 |
| 44484.739583333336 | 31.32 |
| 44484.75 | 31.33 |
| 44484.760416666664 | 31.34 |
| 44484.770833333336 | 31.34 |
| 44484.78125 | 31.36 |
| 44484.791666666664 | 31.36 |
| 44484.802083333336 | 31.36 |
| 44484.8125 | 31.35 |
| 44484.822916666664 | 31.35 |
| 44484.833333333336 | 31.33 |
| 44484.84375 | 31.27 |
| 44484.854166666664 | 31.26 |
| 44484.864583333336 | 31.16 |
| 44484.875 | 31.17 |
| 44484.885416666664 | 31.15 |
| 44484.895833333336 | 31.13 |
| 44484.90625 | 31.14 |
| 44484.916666666664 | 31.14 |
| 44484.927083333336 | 31.15 |
| 44484.9375 | 31.18 |
| 44484.947916666664 | 31.18 |
| 44484.958333333336 | 31.16 |
| 44484.96875 | 31.18 |
| 44484.979166666664 | 31.25 |
| 44484.989583333336 | 31.25 |
| 44485.0 | 31.27 |
| 44485.010416666664 | 31.29 |
| 44485.020833333336 | 31.36 |
| 44485.03125 | 31.35 |
| 44485.041666666664 | 31.41 |
| 44485.052083333336 | 31.41 |
| 44485.0625 | 31.38 |
| 44485.072916666664 | 31.39 |
| 44485.083333333336 | 31.37 |
| 44485.09375 | 31.35 |
| 44485.104166666664 | 31.37 |
| 44485.114583333336 | 31.34 |
| 44485.125 | 31.34 |
| 44485.135416666664 | 31.32 |
| 44485.145833333336 | 31.31 |
| 44485.15625 | 31.31 |
| 44485.166666666664 | 31.29 |
| 44485.177083333336 | 31.28 |
| 44485.1875 | 31.31 |
| 44485.197916666664 | 31.3 |
| 44485.208333333336 | 31.29 |
| 44485.21875 | 31.29 |
| 44485.229166666664 | 31.29 |
| 44485.239583333336 | 31.3 |
| 44485.25 | 31.31 |
| 44485.260416666664 | 31.24 |
| 44485.270833333336 | 31.28 |
| 44485.28125 | 31.29 |
| 44485.291666666664 | 31.29 |
| 44485.302083333336 | 31.3 |
| 44485.3125 | 31.31 |
| 44485.322916666664 | 31.32 |
| 44485.333333333336 | 31.32 |
| 44485.34375 | 31.33 |
| 44485.354166666664 | 31.33 |
| 44485.364583333336 | 31.33 |
| 44485.375 | 31.33 |
| 44485.385416666664 | 31.31 |
| 44485.395833333336 | 31.3 |
| 44485.40625 | 31.24 |
| 44485.416666666664 | 31.21 |
| 44485.427083333336 | 31.2 |
| 44485.4375 | 31.12 |
| 44485.447916666664 | 31.13 |
| 44485.458333333336 | 31.12 |
| 44485.46875 | 31.13 |
| 44485.479166666664 | 31.19 |
| 44485.489583333336 | 31.18 |
| 44485.5 | 31.21 |
| 44485.510416666664 | 31.25 |
| 44485.520833333336 | 31.25 |
| 44485.53125 | 31.25 |
| 44485.541666666664 | 31.28 |
| 44485.552083333336 | 31.29 |
| 44485.5625 | 31.3 |
| 44485.572916666664 | 31.31 |
| 44485.583333333336 | 31.27 |
| 44485.59375 | 31.24 |
| 44485.604166666664 | 31.27 |
| 44485.614583333336 | 31.25 |
| 44485.625 | 31.27 |
| 44485.635416666664 | 31.25 |
| 44485.645833333336 | 31.23 |
| 44485.65625 | 31.25 |
| 44485.666666666664 | 31.24 |
| 44485.677083333336 | 31.24 |
| 44485.6875 | 31.22 |
| 44485.697916666664 | 31.23 |
| 44485.708333333336 | 31.23 |
| 44485.71875 | 31.23 |
| 44485.729166666664 | 31.26 |
| 44485.739583333336 | 31.29 |
| 44485.75 | 31.31 |
| 44485.760416666664 | 31.3 |
| 44485.770833333336 | 31.31 |
| 44485.78125 | 31.35 |
| 44485.791666666664 | 31.39 |
| 44485.802083333336 | 31.42 |
| 44485.8125 | 31.47 |
| 44485.822916666664 | 31.5 |
| 44485.833333333336 | 31.52 |
| 44485.84375 | 31.56 |
| 44485.854166666664 | 31.57 |
| 44485.864583333336 | 31.59 |
| 44485.875 | 31.58 |
| 44485.885416666664 | 31.57 |
| 44485.895833333336 | 31.54 |
| 44485.90625 | 31.48 |
| 44485.916666666664 | 31.46 |
| 44485.927083333336 | 31.42 |
| 44485.9375 | 31.39 |
| 44485.947916666664 | 31.33 |
| 44485.958333333336 | 31.32 |
| 44485.96875 | 31.32 |
| 44485.979166666664 | 31.35 |
| 44485.989583333336 | 31.33 |
| 44486.0 | 31.31 |
| 44486.010416666664 | 31.28 |
| 44486.020833333336 | 31.26 |
| 44486.03125 | 31.19 |
| 44486.041666666664 | 31.17 |
| 44486.052083333336 | 31.14 |
| 44486.0625 | 31.12 |
| 44486.072916666664 | 31.06 |
| 44486.083333333336 | 31.01 |
| 44486.09375 | 30.97 |
| 44486.104166666664 | 30.93 |
| 44486.114583333336 | 30.92 |
| 44486.125 | 30.88 |
| 44486.135416666664 | 30.88 |
| 44486.145833333336 | 30.87 |
| 44486.15625 | 30.88 |
| 44486.166666666664 | 30.9 |
| 44486.177083333336 | 30.87 |
| 44486.1875 | 30.85 |
| 44486.197916666664 | 30.88 |
| 44486.208333333336 | 30.91 |
| 44486.21875 | 30.86 |
| 44486.229166666664 | 30.87 |
| 44486.239583333336 | 30.89 |
| 44486.25 | 30.9 |
| 44486.260416666664 | 30.92 |
| 44486.270833333336 | 30.92 |
| 44486.28125 | 30.95 |
| 44486.291666666664 | 30.98 |
| 44486.302083333336 | 31.01 |
| 44486.3125 | 31.04 |
| 44486.322916666664 | 31.01 |
| 44486.333333333336 | 31 |
| 44486.34375 | 31 |
| 44486.354166666664 | 31.05 |
| 44486.364583333336 | 31.13 |
| 44486.375 | 31.18 |
| 44486.385416666664 | 31.21 |
| 44486.395833333336 | 31.22 |
| 44486.40625 | 31.23 |
| 44486.416666666664 | 31.23 |
| 44486.427083333336 | 31.2 |
| 44486.4375 | 31.12 |
| 44486.447916666664 | 31.1 |
| 44486.458333333336 | 31.06 |
| 44486.46875 | 31.05 |
| 44486.479166666664 | 30.99 |
| 44486.489583333336 | 30.99 |
| 44486.5 | 31.04 |
| 44486.510416666664 | 31.05 |
| 44486.520833333336 | 31.1 |
| 44486.53125 | 31.12 |
| 44486.541666666664 | 31.15 |
| 44486.552083333336 | 31.15 |
| 44486.5625 | 31.16 |
| 44486.572916666664 | 31.13 |
| 44486.583333333336 | 31.15 |
| 44486.59375 | 31.15 |
| 44486.604166666664 | 31.12 |
| 44486.614583333336 | 31.08 |
| 44486.625 | 31.12 |
| 44486.635416666664 | 31.09 |
| 44486.645833333336 | 31.08 |
| 44486.65625 | 31.13 |
| 44486.666666666664 | 31.08 |
| 44486.677083333336 | 31.02 |
| 44486.6875 | 31.05 |
| 44486.697916666664 | 31.01 |
| 44486.708333333336 | 30.96 |
| 44486.71875 | 31.02 |
| 44486.729166666664 | 30.96 |
| 44486.739583333336 | 30.97 |
| 44486.75 | 30.92 |
| 44486.760416666664 | 30.93 |
| 44486.770833333336 | 30.95 |
| 44486.78125 | 30.95 |
| 44486.791666666664 | 30.98 |
| 44486.802083333336 | 31 |
| 44486.8125 | 31 |
| 44486.822916666664 | 31.02 |
| 44486.833333333336 | 31.05 |
| 44486.84375 | 31.05 |
| 44486.854166666664 | 31.05 |
| 44486.864583333336 | 31.06 |
| 44486.875 | 31.09 |
| 44486.885416666664 | 31.12 |
| 44486.895833333336 | 31.15 |
| 44486.90625 | 31.15 |
| 44486.916666666664 | 31.12 |
| 44486.927083333336 | 31.01 |
| 44486.9375 | 30.89 |
| 44486.947916666664 | 30.85 |
| 44486.958333333336 | 30.78 |
| 44486.96875 | 30.71 |
| 44486.979166666664 | 30.67 |
| 44486.989583333336 | 30.69 |
| 44487.0 | 30.69 |
| 44487.010416666664 | 30.7 |
| 44487.020833333336 | 30.74 |
| 44487.03125 | 30.74 |
| 44487.041666666664 | 30.76 |
| 44487.052083333336 | 30.82 |
| 44487.0625 | 31.02 |
| 44487.072916666664 | 30.98 |
| 44487.083333333336 | 31.04 |
| 44487.09375 | 31.08 |
| 44487.104166666664 | 31.11 |
| 44487.114583333336 | 31.18 |
| 44487.125 | 31.1 |
| 44487.135416666664 | 31.15 |
| 44487.145833333336 | 31.14 |
| 44487.15625 | 31.09 |
| 44487.166666666664 | 31.12 |
| 44487.177083333336 | 31.07 |
| 44487.1875 | 31.06 |
| 44487.197916666664 | 30.98 |
| 44487.208333333336 | 30.96 |
| 44487.21875 | 30.99 |
| 44487.229166666664 | 30.88 |
| 44487.239583333336 | 30.86 |
| 44487.25 | 30.83 |
| 44487.260416666664 | 30.89 |
| 44487.270833333336 | 30.93 |
| 44487.28125 | 30.91 |
| 44487.291666666664 | 30.94 |
| 44487.302083333336 | 30.97 |
| 44487.3125 | 30.99 |
| 44487.322916666664 | 31 |
| 44487.333333333336 | 30.98 |
| 44487.34375 | 30.98 |
| 44487.354166666664 | 30.99 |
| 44487.364583333336 | 30.99 |
| 44487.375 | 30.99 |
| 44487.385416666664 | 31.01 |
| 44487.395833333336 | 31.02 |
| 44487.40625 | 30.99 |
| 44487.416666666664 | 30.95 |
| 44487.427083333336 | 30.87 |
| 44487.4375 | 30.81 |
| 44487.447916666664 | 30.75 |
| 44487.458333333336 | 30.73 |
| 44487.46875 | 30.71 |
| 44487.479166666664 | 30.66 |
| 44487.489583333336 | 30.64 |
| 44487.5 | 30.64 |
| 44487.510416666664 | 30.63 |
| 44487.520833333336 | 30.63 |
| 44487.53125 | 30.67 |
| 44487.541666666664 | 30.67 |
| 44487.552083333336 | 30.68 |
| 44487.5625 | 30.74 |
| 44487.572916666664 | 30.81 |
| 44487.583333333336 | 30.86 |
| 44487.59375 | 30.87 |
| 44487.604166666664 | 30.9 |
| 44487.614583333336 | 31.01 |
| 44487.625 | 31.02 |
| 44487.635416666664 | 31 |
| 44487.645833333336 | 31.07 |
| 44487.65625 | 31.04 |
| 44487.666666666664 | 31.02 |
| 44487.677083333336 | 31.03 |
| 44487.6875 | 31.01 |
| 44487.697916666664 | 31 |
| 44487.708333333336 | 30.98 |
| 44487.71875 | 30.95 |
| 44487.729166666664 | 30.86 |
| 44487.739583333336 | 30.9 |
| 44487.75 | 30.92 |
| 44487.760416666664 | 30.92 |
| 44487.770833333336 | 30.92 |
| 44487.78125 | 30.85 |
| 44487.791666666664 | 30.88 |
| 44487.802083333336 | 30.89 |
| 44487.8125 | 30.94 |
| 44487.822916666664 | 30.95 |
| 44487.833333333336 | 30.95 |
| 44487.84375 | 30.97 |
| 44487.854166666664 | 30.99 |
| 44487.864583333336 | 31.01 |
| 44487.875 | 31.01 |
| 44487.885416666664 | 31.01 |
| 44487.895833333336 | 31.01 |
| 44487.90625 | 31 |
| 44487.916666666664 | 30.99 |
| 44487.927083333336 | 30.98 |
| 44487.9375 | 30.96 |
| 44487.947916666664 | 30.91 |
| 44487.958333333336 | 30.87 |
| 44487.96875 | 30.83 |
| 44487.979166666664 | 30.83 |
| 44487.989583333336 | 30.83 |
| 44488.0 | 30.83 |
| 44488.010416666664 | 30.84 |
| 44488.020833333336 | 30.85 |
| 44488.03125 | 30.86 |
| 44488.041666666664 | 30.88 |
| 44488.052083333336 | 30.89 |
| 44488.0625 | 30.9 |
| 44488.072916666664 | 30.9 |
| 44488.083333333336 | 30.95 |
| 44488.09375 | 30.92 |
| 44488.104166666664 | 30.93 |
| 44488.114583333336 | 31 |
| 44488.125 | 31.01 |
| 44488.135416666664 | 31.04 |
| 44488.145833333336 | 31.03 |
| 44488.15625 | 31.02 |
| 44488.166666666664 | 31.03 |
| 44488.177083333336 | 31.04 |
| 44488.1875 | 31.04 |
| 44488.197916666664 | 31.04 |
| 44488.208333333336 | 31.04 |
| 44488.21875 | 31.03 |
| 44488.229166666664 | 31.02 |
| 44488.239583333336 | 30.98 |
| 44488.25 | 30.97 |
| 44488.260416666664 | 30.93 |
| 44488.270833333336 | 30.9 |
| 44488.28125 | 30.94 |
| 44488.291666666664 | 30.96 |
| 44488.302083333336 | 30.95 |
| 44488.3125 | 30.97 |
| 44488.322916666664 | 30.98 |
| 44488.333333333336 | 31 |
| 44488.34375 | 31 |
| 44488.354166666664 | 31 |
| 44488.364583333336 | 31 |
| 44488.375 | 31.01 |
| 44488.385416666664 | 31.01 |
| 44488.395833333336 | 31.01 |
| 44488.40625 | 31.03 |
| 44488.416666666664 | 31.03 |
| 44488.427083333336 | 31.02 |
| 44488.4375 | 31.01 |
| 44488.447916666664 | 30.96 |
| 44488.458333333336 | 30.91 |
| 44488.46875 | 30.89 |
| 44488.479166666664 | 30.87 |
| 44488.489583333336 | 30.84 |
| 44488.5 | 30.83 |
| 44488.510416666664 | 30.79 |
| 44488.520833333336 | 30.81 |
| 44488.53125 | 30.8 |
| 44488.541666666664 | 30.79 |
| 44488.552083333336 | 30.77 |
| 44488.5625 | 30.81 |
| 44488.572916666664 | 30.82 |
| 44488.583333333336 | 30.87 |
| 44488.59375 | 30.92 |
| 44488.604166666664 | 30.91 |
| 44488.614583333336 | 30.95 |
| 44488.625 | 30.96 |
| 44488.635416666664 | 31.02 |
| 44488.645833333336 | 30.99 |
| 44488.65625 | 31.02 |
| 44488.666666666664 | 31 |
| 44488.677083333336 | 31.02 |
| 44488.6875 | 31.02 |
| 44488.697916666664 | 31 |
| 44488.708333333336 | 31.02 |
| 44488.71875 | 31.02 |
| 44488.729166666664 | 30.91 |
| 44488.739583333336 | 30.99 |
| 44488.75 | 30.95 |
| 44488.760416666664 | 31 |
| 44488.770833333336 | 30.91 |
| 44488.78125 | 30.87 |
| 44488.791666666664 | 30.91 |
| 44488.802083333336 | 30.92 |
| 44488.8125 | 30.88 |
| 44488.822916666664 | 30.89 |
| 44488.833333333336 | 30.89 |
| 44488.84375 | 30.91 |
| 44488.854166666664 | 30.93 |
| 44488.864583333336 | 30.94 |
| 44488.875 | 30.94 |
| 44488.885416666664 | 30.94 |
| 44488.895833333336 | 30.95 |
| 44488.90625 | 30.95 |
| 44488.916666666664 | 30.94 |
| 44488.927083333336 | 30.95 |
| 44488.9375 | 30.96 |
| 44488.947916666664 | 30.95 |
| 44488.958333333336 | 30.94 |
| 44488.96875 | 30.93 |
| 44488.979166666664 | 30.91 |
| 44488.989583333336 | 30.87 |
| 44489.0 | 30.84 |
| 44489.010416666664 | 30.82 |
| 44489.020833333336 | 30.82 |
| 44489.03125 | 30.81 |
| 44489.041666666664 | 30.81 |
| 44489.052083333336 | 30.79 |
| 44489.0625 | 30.79 |
| 44489.072916666664 | 30.8 |
| 44489.083333333336 | 30.81 |
| 44489.09375 | 30.86 |
| 44489.104166666664 | 30.87 |
| 44489.114583333336 | 30.95 |
| 44489.125 | 30.95 |
| 44489.135416666664 | 30.97 |
| 44489.145833333336 | 30.96 |
| 44489.15625 | 31.02 |
| 44489.166666666664 | 30.93 |
| 44489.177083333336 | 30.96 |
| 44489.1875 | 30.97 |
| 44489.197916666664 | 30.98 |
| 44489.208333333336 | 30.99 |
| 44489.21875 | 30.99 |
| 44489.229166666664 | 30.98 |
| 44489.239583333336 | 30.96 |
| 44489.25 | 30.96 |
| 44489.260416666664 | 30.92 |
| 44489.270833333336 | 30.92 |
| 44489.28125 | 30.88 |
| 44489.291666666664 | 30.87 |
| 44489.302083333336 | 30.91 |
| 44489.3125 | 30.85 |
| 44489.322916666664 | 30.86 |
| 44489.333333333336 | 30.87 |
| 44489.34375 | 30.89 |
| 44489.354166666664 | 30.9 |
| 44489.364583333336 | 30.93 |
| 44489.375 | 30.94 |
| 44489.385416666664 | 30.95 |
| 44489.395833333336 | 30.96 |
| 44489.40625 | 30.96 |
| 44489.416666666664 | 30.96 |
| 44489.427083333336 | 30.96 |
| 44489.4375 | 30.96 |
| 44489.447916666664 | 30.97 |
| 44489.458333333336 | 30.96 |
| 44489.46875 | 30.95 |
| 44489.479166666664 | 30.95 |
| 44489.489583333336 | 30.93 |
| 44489.5 | 30.91 |
| 44489.510416666664 | 30.88 |
| 44489.520833333336 | 30.86 |
| 44489.53125 | 30.84 |
| 44489.541666666664 | 30.84 |
| 44489.552083333336 | 30.82 |
| 44489.5625 | 30.82 |
| 44489.572916666664 | 30.82 |
| 44489.583333333336 | 30.85 |
| 44489.59375 | 30.84 |
| 44489.604166666664 | 30.87 |
| 44489.614583333336 | 30.89 |
| 44489.625 | 30.92 |
| 44489.635416666664 | 30.92 |
| 44489.645833333336 | 30.94 |
| 44489.65625 | 30.94 |
| 44489.666666666664 | 30.94 |
| 44489.677083333336 | 30.97 |
| 44489.6875 | 30.97 |
| 44489.697916666664 | 30.91 |
| 44489.708333333336 | 30.92 |
| 44489.71875 | 30.92 |
| 44489.729166666664 | 30.89 |
| 44489.739583333336 | 30.91 |
| 44489.75 | 30.89 |
| 44489.760416666664 | 30.86 |
| 44489.770833333336 | 30.86 |
| 44489.78125 | 30.84 |
| 44489.791666666664 | 30.87 |
| 44489.802083333336 | 30.82 |
| 44489.8125 | 30.8 |
| 44489.822916666664 | 30.82 |
| 44489.833333333336 | 30.8 |
| 44489.84375 | 30.79 |
| 44489.854166666664 | 30.81 |
| 44489.864583333336 | 30.82 |
| 44489.875 | 30.87 |
| 44489.885416666664 | 30.89 |
| 44489.895833333336 | 30.9 |
| 44489.90625 | 30.92 |
| 44489.916666666664 | 30.92 |
| 44489.927083333336 | 30.93 |
| 44489.9375 | 30.93 |
| 44489.947916666664 | 30.93 |
| 44489.958333333336 | 30.93 |
| 44489.96875 | 30.93 |
| 44489.979166666664 | 30.94 |
| 44489.989583333336 | 30.94 |
| 44490.0 | 30.94 |
| 44490.010416666664 | 30.94 |
| 44490.020833333336 | 30.93 |
| 44490.03125 | 30.91 |
| 44490.041666666664 | 30.88 |
| 44490.052083333336 | 30.86 |
| 44490.0625 | 30.85 |
| 44490.072916666664 | 30.84 |
| 44490.083333333336 | 30.84 |
| 44490.09375 | 30.84 |
| 44490.104166666664 | 30.81 |
| 44490.114583333336 | 30.84 |
| 44490.125 | 30.9 |
| 44490.135416666664 | 30.92 |
| 44490.145833333336 | 30.96 |
| 44490.15625 | 30.96 |
| 44490.166666666664 | 30.97 |
| 44490.177083333336 | 30.95 |
| 44490.1875 | 30.97 |
| 44490.197916666664 | 30.93 |
| 44490.208333333336 | 30.96 |
| 44490.21875 | 30.96 |
| 44490.229166666664 | 30.95 |
| 44490.239583333336 | 30.95 |
| 44490.25 | 30.91 |
| 44490.260416666664 | 30.91 |
| 44490.270833333336 | 30.89 |
| 44490.28125 | 30.84 |
| 44490.291666666664 | 30.84 |
| 44490.302083333336 | 30.8 |
| 44490.3125 | 30.79 |
| 44490.322916666664 | 30.84 |
| 44490.333333333336 | 30.85 |
| 44490.34375 | 30.82 |
| 44490.354166666664 | 30.84 |
| 44490.364583333336 | 30.87 |
| 44490.375 | 30.89 |
| 44490.385416666664 | 30.9 |
| 44490.395833333336 | 30.91 |
| 44490.40625 | 30.92 |
| 44490.416666666664 | 30.92 |
| 44490.427083333336 | 30.92 |
| 44490.4375 | 30.93 |
| 44490.447916666664 | 30.94 |
| 44490.458333333336 | 30.94 |
| 44490.46875 | 30.94 |
| 44490.479166666664 | 30.95 |
| 44490.489583333336 | 30.95 |
| 44490.5 | 30.91 |
| 44490.510416666664 | 30.88 |
| 44490.520833333336 | 30.85 |
| 44490.53125 | 30.83 |
| 44490.541666666664 | 30.81 |
| 44490.552083333336 | 30.8 |
| 44490.5625 | 30.8 |
| 44490.572916666664 | 30.8 |
| 44490.583333333336 | 30.8 |
| 44490.59375 | 30.8 |
| 44490.604166666664 | 30.8 |
| 44490.614583333336 | 30.82 |
| 44490.625 | 30.83 |
| 44490.635416666664 | 30.84 |
| 44490.645833333336 | 30.86 |
| 44490.65625 | 30.87 |
| 44490.666666666664 | 30.91 |
| 44490.677083333336 | 30.92 |
| 44490.6875 | 30.94 |
| 44490.697916666664 | 30.95 |
| 44490.708333333336 | 30.93 |
| 44490.71875 | 30.98 |
| 44490.729166666664 | 30.96 |
| 44490.739583333336 | 30.92 |
| 44490.75 | 30.96 |
| 44490.760416666664 | 30.94 |
| 44490.770833333336 | 30.94 |
| 44490.78125 | 30.93 |
| 44490.791666666664 | 30.93 |
| 44490.802083333336 | 30.9 |
| 44490.8125 | 30.89 |
| 44490.822916666664 | 30.87 |
| 44490.833333333336 | 30.87 |
| 44490.84375 | 30.87 |
| 44490.854166666664 | 30.89 |
| 44490.864583333336 | 30.88 |
| 44490.875 | 30.86 |
| 44490.885416666664 | 30.86 |
| 44490.895833333336 | 30.89 |
| 44490.90625 | 30.92 |
| 44490.916666666664 | 30.94 |
| 44490.927083333336 | 30.93 |
| 44490.9375 | 30.92 |
| 44490.947916666664 | 30.94 |
| 44490.958333333336 | 30.96 |
| 44490.96875 | 30.97 |
| 44490.979166666664 | 31.01 |
| 44490.989583333336 | 31.01 |
| 44491.0 | 31.01 |
| 44491.010416666664 | 31.02 |
| 44491.020833333336 | 31.01 |
| 44491.03125 | 31 |
| 44491.041666666664 | 31.02 |
| 44491.052083333336 | 31.03 |
| 44491.0625 | 31.04 |
| 44491.072916666664 | 31.04 |
| 44491.083333333336 | 31.02 |
| 44491.09375 | 31.02 |
| 44491.104166666664 | 30.98 |
| 44491.114583333336 | 30.98 |
| 44491.125 | 30.98 |
| 44491.135416666664 | 31.01 |
| 44491.145833333336 | 31.02 |
| 44491.15625 | 31.04 |
| 44491.166666666664 | 31.04 |
| 44491.177083333336 | 31.06 |
| 44491.1875 | 31.04 |
| 44491.197916666664 | 31.06 |
| 44491.208333333336 | 30.98 |
| 44491.21875 | 30.97 |
| 44491.229166666664 | 30.98 |
| 44491.239583333336 | 30.95 |
| 44491.25 | 30.94 |
| 44491.260416666664 | 30.91 |
| 44491.270833333336 | 30.92 |
| 44491.28125 | 30.87 |
| 44491.291666666664 | 30.86 |
| 44491.302083333336 | 30.87 |
| 44491.3125 | 30.83 |
| 44491.322916666664 | 30.82 |
| 44491.333333333336 | 30.81 |
| 44491.34375 | 30.81 |
| 44491.354166666664 | 30.82 |
| 44491.364583333336 | 30.83 |
| 44491.375 | 30.83 |
| 44491.385416666664 | 30.84 |
| 44491.395833333336 | 30.88 |
| 44491.40625 | 30.92 |
| 44491.416666666664 | 30.94 |
| 44491.427083333336 | 30.95 |
| 44491.4375 | 30.96 |
| 44491.447916666664 | 30.97 |
| 44491.458333333336 | 30.99 |
| 44491.46875 | 31.03 |
| 44491.479166666664 | 31.07 |
| 44491.489583333336 | 31.12 |
| 44491.5 | 31.14 |
| 44491.510416666664 | 31.14 |
| 44491.520833333336 | 31.14 |
| 44491.53125 | 31.13 |
| 44491.541666666664 | 31.11 |
| 44491.552083333336 | 31.08 |
| 44491.5625 | 31.04 |
| 44491.572916666664 | 31.02 |
| 44491.583333333336 | 30.99 |
| 44491.59375 | 30.96 |
| 44491.604166666664 | 30.94 |
| 44491.614583333336 | 30.91 |
| 44491.625 | 30.92 |
| 44491.635416666664 | 30.94 |
| 44491.645833333336 | 30.95 |
| 44491.65625 | 30.96 |
| 44491.666666666664 | 30.99 |
| 44491.677083333336 | 30.99 |
| 44491.6875 | 31 |
| 44491.697916666664 | 31 |
| 44491.708333333336 | 30.98 |
| 44491.71875 | 30.98 |
| 44491.729166666664 | 30.96 |
| 44491.739583333336 | 30.96 |
| 44491.75 | 30.94 |
| 44491.760416666664 | 30.93 |
| 44491.770833333336 | 30.92 |
| 44491.78125 | 30.92 |
| 44491.791666666664 | 30.88 |
| 44491.802083333336 | 30.9 |
| 44491.8125 | 30.9 |
| 44491.822916666664 | 30.85 |
| 44491.833333333336 | 30.83 |
| 44491.84375 | 30.78 |
| 44491.854166666664 | 30.71 |
| 44491.864583333336 | 30.69 |
| 44491.875 | 30.77 |
| 44491.885416666664 | 30.76 |
| 44491.895833333336 | 30.73 |
| 44491.90625 | 30.75 |
| 44491.916666666664 | 30.77 |
| 44491.927083333336 | 30.79 |
| 44491.9375 | 30.85 |
| 44491.947916666664 | 30.86 |
| 44491.958333333336 | 30.88 |
| 44491.96875 | 30.89 |
| 44491.979166666664 | 30.89 |
| 44491.989583333336 | 30.9 |
| 44492.0 | 30.91 |
| 44492.010416666664 | 30.92 |
| 44492.020833333336 | 30.94 |
| 44492.03125 | 30.96 |
| 44492.041666666664 | 30.97 |
| 44492.052083333336 | 30.98 |
| 44492.0625 | 30.98 |
| 44492.072916666664 | 31 |
| 44492.083333333336 | 31.01 |
| 44492.09375 | 31 |
| 44492.104166666664 | 30.98 |
| 44492.114583333336 | 30.95 |
| 44492.125 | 30.94 |
| 44492.135416666664 | 30.91 |
| 44492.145833333336 | 30.92 |
| 44492.15625 | 30.91 |
| 44492.166666666664 | 30.95 |
| 44492.177083333336 | 30.98 |
| 44492.1875 | 30.97 |
| 44492.197916666664 | 30.96 |
| 44492.208333333336 | 30.98 |
| 44492.21875 | 30.95 |
| 44492.229166666664 | 30.94 |
| 44492.239583333336 | 30.94 |
| 44492.25 | 30.9 |
| 44492.260416666664 | 30.88 |
| 44492.270833333336 | 30.91 |
| 44492.28125 | 30.83 |
| 44492.291666666664 | 30.85 |
| 44492.302083333336 | 30.83 |
| 44492.3125 | 30.79 |
| 44492.322916666664 | 30.75 |
| 44492.333333333336 | 30.73 |
| 44492.34375 | 30.72 |
| 44492.354166666664 | 30.72 |
| 44492.364583333336 | 30.73 |
| 44492.375 | 30.77 |
| 44492.385416666664 | 30.77 |
| 44492.395833333336 | 30.76 |
| 44492.40625 | 30.76 |
| 44492.416666666664 | 30.78 |
| 44492.427083333336 | 30.81 |
| 44492.4375 | 30.82 |
| 44492.447916666664 | 30.86 |
| 44492.458333333336 | 30.88 |
| 44492.46875 | 30.9 |
| 44492.479166666664 | 30.91 |
| 44492.489583333336 | 30.91 |
| 44492.5 | 30.93 |
| 44492.510416666664 | 30.95 |
| 44492.520833333336 | 30.96 |
| 44492.53125 | 30.96 |
| 44492.541666666664 | 30.97 |
| 44492.552083333336 | 30.98 |
| 44492.5625 | 30.98 |
| 44492.572916666664 | 30.97 |
| 44492.583333333336 | 30.94 |
| 44492.59375 | 30.91 |
| 44492.604166666664 | 30.9 |
| 44492.614583333336 | 30.88 |
| 44492.625 | 30.85 |
| 44492.635416666664 | 30.82 |
| 44492.645833333336 | 30.81 |
| 44492.65625 | 30.79 |
| 44492.666666666664 | 30.81 |
| 44492.677083333336 | 30.82 |
| 44492.6875 | 30.9 |
| 44492.697916666664 | 30.93 |
| 44492.708333333336 | 30.97 |
| 44492.71875 | 30.95 |
| 44492.729166666664 | 30.94 |
| 44492.739583333336 | 30.93 |
| 44492.75 | 30.95 |
| 44492.760416666664 | 30.96 |
| 44492.770833333336 | 30.95 |
| 44492.78125 | 30.93 |
| 44492.791666666664 | 30.89 |
| 44492.802083333336 | 30.91 |
| 44492.8125 | 30.9 |
| 44492.822916666664 | 30.89 |
| 44492.833333333336 | 30.9 |
| 44492.84375 | 30.85 |
| 44492.854166666664 | 30.86 |
| 44492.864583333336 | 30.81 |
| 44492.875 | 30.78 |
| 44492.885416666664 | 30.79 |
| 44492.895833333336 | 30.74 |
| 44492.90625 | 30.72 |
| 44492.916666666664 | 30.76 |
| 44492.927083333336 | 30.78 |
| 44492.9375 | 30.74 |
| 44492.947916666664 | 30.76 |
| 44492.958333333336 | 30.79 |
| 44492.96875 | 30.8 |
| 44492.979166666664 | 30.84 |
| 44492.989583333336 | 30.84 |
| 44493.0 | 30.84 |
| 44493.010416666664 | 30.85 |
| 44493.020833333336 | 30.86 |
| 44493.03125 | 30.86 |
| 44493.041666666664 | 30.86 |
| 44493.052083333336 | 30.87 |
| 44493.0625 | 30.87 |
| 44493.072916666664 | 30.88 |
| 44493.083333333336 | 30.89 |
| 44493.09375 | 30.9 |
| 44493.104166666664 | 30.91 |
| 44493.114583333336 | 30.91 |
| 44493.125 | 30.91 |
| 44493.135416666664 | 30.91 |
| 44493.145833333336 | 30.91 |
| 44493.15625 | 30.91 |
| 44493.166666666664 | 30.87 |
| 44493.177083333336 | 30.9 |
| 44493.1875 | 30.89 |
| 44493.197916666664 | 30.88 |
| 44493.208333333336 | 30.91 |
| 44493.21875 | 30.95 |
| 44493.229166666664 | 30.91 |
| 44493.239583333336 | 30.91 |
| 44493.25 | 30.92 |
| 44493.260416666664 | 30.91 |
| 44493.270833333336 | 30.85 |
| 44493.28125 | 30.86 |
| 44493.291666666664 | 30.84 |
| 44493.302083333336 | 30.82 |
| 44493.3125 | 30.79 |
| 44493.322916666664 | 30.79 |
| 44493.333333333336 | 30.74 |
| 44493.34375 | 30.72 |
| 44493.354166666664 | 30.7 |
| 44493.364583333336 | 30.69 |
| 44493.375 | 30.68 |
| 44493.385416666664 | 30.67 |
| 44493.395833333336 | 30.67 |
| 44493.40625 | 30.68 |
| 44493.416666666664 | 30.72 |
| 44493.427083333336 | 30.72 |
| 44493.4375 | 30.7 |
| 44493.447916666664 | 30.72 |
| 44493.458333333336 | 30.76 |
| 44493.46875 | 30.78 |
| 44493.479166666664 | 30.81 |
| 44493.489583333336 | 30.84 |
| 44493.5 | 30.85 |
| 44493.510416666664 | 30.85 |
| 44493.520833333336 | 30.86 |
| 44493.53125 | 30.88 |
| 44493.541666666664 | 30.89 |
| 44493.552083333336 | 30.9 |
| 44493.5625 | 30.91 |
| 44493.572916666664 | 30.91 |
| 44493.583333333336 | 30.91 |
| 44493.59375 | 30.9 |
| 44493.604166666664 | 30.89 |
| 44493.614583333336 | 30.88 |
| 44493.625 | 30.89 |
| 44493.635416666664 | 30.9 |
| 44493.645833333336 | 30.89 |
| 44493.65625 | 30.89 |
| 44493.666666666664 | 30.87 |
| 44493.677083333336 | 30.87 |
| 44493.6875 | 30.88 |
| 44493.697916666664 | 30.89 |
| 44493.708333333336 | 30.9 |
| 44493.71875 | 30.92 |
| 44493.729166666664 | 30.93 |
| 44493.739583333336 | 30.92 |
| 44493.75 | 30.92 |
| 44493.760416666664 | 30.91 |
| 44493.770833333336 | 30.91 |
| 44493.78125 | 30.92 |
| 44493.791666666664 | 30.93 |
| 44493.802083333336 | 30.95 |
| 44493.8125 | 30.93 |
| 44493.822916666664 | 30.89 |
| 44493.833333333336 | 30.91 |
| 44493.84375 | 30.9 |
| 44493.854166666664 | 30.89 |
| 44493.864583333336 | 30.87 |
| 44493.875 | 30.84 |
| 44493.885416666664 | 30.85 |
| 44493.895833333336 | 30.84 |
| 44493.90625 | 30.8 |
| 44493.916666666664 | 30.8 |
| 44493.927083333336 | 30.77 |
| 44493.9375 | 30.81 |
| 44493.947916666664 | 30.8 |
| 44493.958333333336 | 30.78 |
| 44493.96875 | 30.77 |
| 44493.979166666664 | 30.8 |
| 44493.989583333336 | 30.82 |
| 44494.0 | 30.85 |
| 44494.010416666664 | 30.87 |
| 44494.020833333336 | 30.87 |
| 44494.03125 | 30.87 |
| 44494.041666666664 | 30.87 |
| 44494.052083333336 | 30.88 |
| 44494.0625 | 30.89 |
| 44494.072916666664 | 30.91 |
| 44494.083333333336 | 30.91 |
| 44494.09375 | 30.92 |
| 44494.104166666664 | 30.93 |
| 44494.114583333336 | 30.94 |
| 44494.125 | 30.95 |
| 44494.135416666664 | 30.95 |
| 44494.145833333336 | 30.95 |
| 44494.15625 | 30.96 |
| 44494.166666666664 | 30.91 |
| 44494.177083333336 | 30.92 |
| 44494.1875 | 30.93 |
| 44494.197916666664 | 30.92 |
| 44494.208333333336 | 30.93 |
| 44494.21875 | 30.96 |
| 44494.229166666664 | 30.95 |
| 44494.239583333336 | 30.94 |
| 44494.25 | 30.94 |
| 44494.260416666664 | 30.94 |
| 44494.270833333336 | 30.94 |
| 44494.28125 | 30.92 |
| 44494.291666666664 | 30.89 |
| 44494.302083333336 | 30.9 |
| 44494.3125 | 30.89 |
| 44494.322916666664 | 30.82 |
| 44494.333333333336 | 30.82 |
| 44494.34375 | 30.78 |
| 44494.354166666664 | 30.75 |
| 44494.364583333336 | 30.72 |
| 44494.375 | 30.72 |
| 44494.385416666664 | 30.69 |
| 44494.395833333336 | 30.68 |
| 44494.40625 | 30.69 |
| 44494.416666666664 | 30.67 |
| 44494.427083333336 | 30.67 |
| 44494.4375 | 30.7 |
| 44494.447916666664 | 30.71 |
| 44494.458333333336 | 30.7 |
| 44494.46875 | 30.7 |
| 44494.479166666664 | 30.72 |
| 44494.489583333336 | 30.75 |
| 44494.5 | 30.79 |
| 44494.510416666664 | 30.83 |
| 44494.520833333336 | 30.88 |
| 44494.53125 | 30.91 |
| 44494.541666666664 | 30.91 |
| 44494.552083333336 | 30.92 |
| 44494.5625 | 30.92 |
| 44494.572916666664 | 30.93 |
| 44494.583333333336 | 30.93 |
| 44494.59375 | 30.94 |
| 44494.604166666664 | 30.97 |
| 44494.614583333336 | 30.97 |
| 44494.625 | 30.97 |
| 44494.635416666664 | 30.98 |
| 44494.645833333336 | 31 |
| 44494.65625 | 31 |
| 44494.666666666664 | 31.01 |
| 44494.677083333336 | 31.03 |
| 44494.6875 | 31.03 |
| 44494.697916666664 | 30.96 |
| 44494.708333333336 | 30.96 |
| 44494.71875 | 30.97 |
| 44494.729166666664 | 31 |
| 44494.739583333336 | 31 |
| 44494.75 | 31 |
| 44494.760416666664 | 30.96 |
| 44494.770833333336 | 30.99 |
| 44494.78125 | 30.97 |
| 44494.791666666664 | 30.96 |
| 44494.802083333336 | 30.96 |
| 44494.8125 | 30.96 |
| 44494.822916666664 | 30.94 |
| 44494.833333333336 | 30.92 |
| 44494.84375 | 30.89 |
| 44494.854166666664 | 30.89 |
| 44494.864583333336 | 30.88 |
| 44494.875 | 30.89 |
| 44494.885416666664 | 30.85 |
| 44494.895833333336 | 30.81 |
| 44494.90625 | 30.74 |
| 44494.916666666664 | 30.72 |
| 44494.927083333336 | 30.71 |
| 44494.9375 | 30.69 |
| 44494.947916666664 | 30.69 |
| 44494.958333333336 | 30.68 |
| 44494.96875 | 30.69 |
| 44494.979166666664 | 30.73 |
| 44494.989583333336 | 30.74 |
| 44495.0 | 30.74 |
| 44495.010416666664 | 30.75 |
| 44495.020833333336 | 30.78 |
| 44495.03125 | 30.83 |
| 44495.041666666664 | 30.85 |
| 44495.052083333336 | 30.87 |
| 44495.0625 | 30.9 |
| 44495.072916666664 | 30.91 |
| 44495.083333333336 | 30.92 |
| 44495.09375 | 30.93 |
| 44495.104166666664 | 30.95 |
| 44495.114583333336 | 30.97 |
| 44495.125 | 30.98 |
| 44495.135416666664 | 31 |
| 44495.145833333336 | 31.01 |
| 44495.15625 | 31.02 |
| 44495.166666666664 | 31.03 |
| 44495.177083333336 | 31.05 |
| 44495.1875 | 31.05 |
| 44495.197916666664 | 31.05 |
| 44495.208333333336 | 31.01 |
| 44495.21875 | 31.01 |
| 44495.229166666664 | 31.02 |
| 44495.239583333336 | 30.49 |
| 44495.25 | 30.29 |
| 44495.260416666664 | 30.31 |
| 44495.270833333336 | 29.92 |
| 44495.28125 | 29.24 |
| 44495.291666666664 | 29.47 |
| 44495.302083333336 | 29.23 |
| 44495.3125 | 29.6 |
| 44495.322916666664 | 29.67 |
| 44495.333333333336 | 29.8 |
| 44495.34375 | 29.72 |
| 44495.354166666664 | 29.51 |
| 44495.364583333336 | 29.53 |
| 44495.375 | 29.48 |
| 44495.385416666664 | 29.41 |
| 44495.395833333336 | 29.22 |
| 44495.40625 | 29.27 |
| 44495.416666666664 | 29.38 |
| 44495.427083333336 | 29.42 |
| 44495.4375 | 29.35 |
| 44495.447916666664 | 29.38 |
| 44495.458333333336 | 29.4 |
| 44495.46875 | 29.43 |
| 44495.479166666664 | 29.47 |
| 44495.489583333336 | 29.48 |
| 44495.5 | 29.48 |
| 44495.510416666664 | 29.46 |
| 44495.520833333336 | 29.5 |
| 44495.53125 | 29.57 |
| 44495.541666666664 | 29.63 |
| 44495.552083333336 | 29.67 |
| 44495.5625 | 29.84 |
| 44495.572916666664 | 29.96 |
| 44495.583333333336 | 30.03 |
| 44495.59375 | 30.12 |
| 44495.604166666664 | 30.18 |
| 44495.614583333336 | 30.2 |
| 44495.625 | 30.23 |
| 44495.635416666664 | 30.28 |
| 44495.645833333336 | 30.33 |
| 44495.65625 | 30.4 |
| 44495.666666666664 | 30.42 |
| 44495.677083333336 | 30.45 |
| 44495.6875 | 30.47 |
| 44495.697916666664 | 30.49 |
| 44495.708333333336 | 30.5 |
| 44495.71875 | 30.49 |
| 44495.729166666664 | 30.4 |
| 44495.739583333336 | 30.44 |
| 44495.75 | 30.44 |
| 44495.760416666664 | 30.44 |
| 44495.770833333336 | 30.43 |
| 44495.78125 | 30.4 |
| 44495.791666666664 | 30.31 |
| 44495.802083333336 | 30.27 |
| 44495.8125 | 30.29 |
| 44495.822916666664 | 30.3 |
| 44495.833333333336 | 30.29 |
| 44495.84375 | 30.15 |
| 44495.854166666664 | 30.1 |
| 44495.864583333336 | 30.06 |
| 44495.875 | 30.02 |
| 44495.885416666664 | 29.95 |
| 44495.895833333336 | 29.92 |
| 44495.90625 | 29.9 |
| 44495.916666666664 | 29.85 |
| 44495.927083333336 | 29.8 |
| 44495.9375 | 29.76 |
| 44495.947916666664 | 29.7 |
| 44495.958333333336 | 29.65 |
| 44495.96875 | 29.63 |
| 44495.979166666664 | 29.64 |
| 44495.989583333336 | 29.69 |
| 44496.0 | 29.74 |
| 44496.010416666664 | 29.72 |
| 44496.020833333336 | 29.71 |
| 44496.03125 | 29.72 |
| 44496.041666666664 | 29.73 |
| 44496.052083333336 | 29.75 |
| 44496.0625 | 29.8 |
| 44496.072916666664 | 29.84 |
| 44496.083333333336 | 29.9 |
| 44496.09375 | 29.97 |
| 44496.104166666664 | 30 |
| 44496.114583333336 | 30.06 |
| 44496.125 | 30.1 |
| 44496.135416666664 | 30.11 |
| 44496.145833333336 | 30.14 |
| 44496.15625 | 30.15 |
| 44496.166666666664 | 30.19 |
| 44496.177083333336 | 30.21 |
| 44496.1875 | 30.22 |
| 44496.197916666664 | 30.23 |
| 44496.208333333336 | 30.24 |
| 44496.21875 | 30.24 |
| 44496.229166666664 | 30.22 |
| 44496.239583333336 | 30.28 |
| 44496.25 | 30.31 |
| 44496.260416666664 | 30.31 |
| 44496.270833333336 | 30.29 |
| 44496.28125 | 30.29 |
| 44496.291666666664 | 30.29 |
| 44496.302083333336 | 30.27 |
| 44496.3125 | 30.27 |
| 44496.322916666664 | 30.26 |
| 44496.333333333336 | 30.27 |
| 44496.34375 | 30.26 |
| 44496.354166666664 | 30.28 |
| 44496.364583333336 | 30.26 |
| 44496.375 | 30.24 |
| 44496.385416666664 | 30.23 |
| 44496.395833333336 | 30.22 |
| 44496.40625 | 30.21 |
| 44496.416666666664 | 30.16 |
| 44496.427083333336 | 30.14 |
| 44496.4375 | 30.15 |
| 44496.447916666664 | 30.13 |
| 44496.458333333336 | 30.13 |
| 44496.46875 | 30.16 |
| 44496.479166666664 | 30.18 |
| 44496.489583333336 | 30.18 |
| 44496.5 | 30.2 |
| 44496.510416666664 | 30.22 |
| 44496.520833333336 | 30.24 |
| 44496.53125 | 30.29 |
| 44496.541666666664 | 30.33 |
| 44496.552083333336 | 30.35 |
| 44496.5625 | 30.37 |
| 44496.572916666664 | 30.37 |
| 44496.583333333336 | 30.39 |
| 44496.59375 | 30.4 |
| 44496.604166666664 | 30.42 |
| 44496.614583333336 | 30.42 |
| 44496.625 | 30.42 |
| 44496.635416666664 | 30.43 |
| 44496.645833333336 | 30.45 |
| 44496.65625 | 30.47 |
| 44496.666666666664 | 30.49 |
| 44496.677083333336 | 30.5 |
| 44496.6875 | 30.52 |
| 44496.697916666664 | 30.52 |
| 44496.708333333336 | 30.53 |
| 44496.71875 | 30.54 |
| 44496.729166666664 | 30.54 |
| 44496.739583333336 | 30.55 |
| 44496.75 | 30.54 |
| 44496.760416666664 | 30.55 |
| 44496.770833333336 | 30.54 |
| 44496.78125 | 30.5 |
| 44496.791666666664 | 30.51 |
| 44496.802083333336 | 30.52 |
| 44496.8125 | 30.5 |
| 44496.822916666664 | 30.5 |
| 44496.833333333336 | 30.5 |
| 44496.84375 | 30.48 |
| 44496.854166666664 | 30.48 |
| 44496.864583333336 | 30.47 |
| 44496.875 | 30.5 |
| 44496.885416666664 | 30.49 |
| 44496.895833333336 | 30.49 |
| 44496.90625 | 30.48 |
| 44496.916666666664 | 30.45 |
| 44496.927083333336 | 30.44 |
| 44496.9375 | 30.41 |
| 44496.947916666664 | 30.41 |
| 44496.958333333336 | 30.4 |
| 44496.96875 | 30.4 |
| 44496.979166666664 | 30.4 |
| 44496.989583333336 | 30.4 |
| 44497.0 | 30.4 |
| 44497.010416666664 | 30.4 |
| 44497.020833333336 | 30.4 |
| 44497.03125 | 30.39 |
| 44497.041666666664 | 30.38 |
| 44497.052083333336 | 30.38 |
| 44497.0625 | 30.39 |
| 44497.072916666664 | 30.4 |
| 44497.083333333336 | 30.4 |
| 44497.09375 | 30.4 |
| 44497.104166666664 | 30.41 |
| 44497.114583333336 | 30.41 |
| 44497.125 | 30.42 |
| 44497.135416666664 | 30.43 |
| 44497.145833333336 | 30.45 |
| 44497.15625 | 30.46 |
| 44497.166666666664 | 30.48 |
| 44497.177083333336 | 30.5 |
| 44497.1875 | 30.51 |
| 44497.197916666664 | 30.51 |
| 44497.208333333336 | 30.51 |
| 44497.21875 | 30.52 |
| 44497.229166666664 | 30.52 |
| 44497.239583333336 | 30.52 |
| 44497.25 | 30.48 |
| 44497.260416666664 | 30.51 |
| 44497.270833333336 | 30.5 |
| 44497.28125 | 30.5 |
| 44497.291666666664 | 30.5 |
| 44497.302083333336 | 30.5 |
| 44497.3125 | 30.5 |
| 44497.322916666664 | 30.48 |
| 44497.333333333336 | 30.49 |
| 44497.34375 | 30.49 |
| 44497.354166666664 | 30.47 |
| 44497.364583333336 | 30.48 |
| 44497.375 | 30.46 |
| 44497.385416666664 | 30.48 |
| 44497.395833333336 | 30.47 |
| 44497.40625 | 30.47 |
| 44497.416666666664 | 30.47 |
| 44497.427083333336 | 30.42 |
| 44497.4375 | 30.46 |
| 44497.447916666664 | 30.44 |
| 44497.458333333336 | 30.44 |
| 44497.46875 | 30.43 |
| 44497.479166666664 | 30.42 |
| 44497.489583333336 | 30.42 |
| 44497.5 | 30.42 |
| 44497.510416666664 | 30.42 |
| 44497.520833333336 | 30.41 |
| 44497.53125 | 30.41 |
| 44497.541666666664 | 30.43 |
| 44497.552083333336 | 30.41 |
| 44497.5625 | 30.42 |
| 44497.572916666664 | 30.42 |
| 44497.583333333336 | 30.42 |
| 44497.59375 | 30.43 |
| 44497.604166666664 | 30.45 |
| 44497.614583333336 | 30.46 |
| 44497.625 | 30.47 |
| 44497.635416666664 | 30.49 |
| 44497.645833333336 | 30.5 |
| 44497.65625 | 30.51 |
| 44497.666666666664 | 30.51 |
| 44497.677083333336 | 30.52 |
| 44497.6875 | 30.52 |
| 44497.697916666664 | 30.52 |
| 44497.708333333336 | 30.52 |
| 44497.71875 | 30.52 |
| 44497.729166666664 | 30.52 |
| 44497.739583333336 | 30.52 |
| 44497.75 | 30.52 |
| 44497.760416666664 | 30.52 |
| 44497.770833333336 | 30.52 |
| 44497.78125 | 30.52 |
| 44497.791666666664 | 30.47 |
| 44497.802083333336 | 30.52 |
| 44497.8125 | 30.51 |
| 44497.822916666664 | 30.53 |
| 44497.833333333336 | 30.52 |
| 44497.84375 | 30.52 |
| 44497.854166666664 | 30.51 |
| 44497.864583333336 | 30.5 |
| 44497.875 | 30.5 |
| 44497.885416666664 | 30.49 |
| 44497.895833333336 | 30.5 |
| 44497.90625 | 30.49 |
| 44497.916666666664 | 30.48 |
| 44497.927083333336 | 30.48 |
| 44497.9375 | 30.48 |
| 44497.947916666664 | 30.47 |
| 44497.958333333336 | 30.46 |
| 44497.96875 | 30.46 |
| 44497.979166666664 | 30.46 |
| 44497.989583333336 | 30.46 |
| 44498.0 | 30.45 |
| 44498.010416666664 | 30.45 |
| 44498.020833333336 | 30.44 |
| 44498.03125 | 30.44 |
| 44498.041666666664 | 30.43 |
| 44498.052083333336 | 30.4 |
| 44498.0625 | 30.38 |
| 44498.072916666664 | 30.39 |
| 44498.083333333336 | 30.37 |
| 44498.09375 | 30.34 |
| 44498.104166666664 | 30.34 |
| 44498.114583333336 | 30.08 |
| 44498.125 | 30.39 |
| 44498.135416666664 | 30.38 |
| 44498.145833333336 | 30.38 |
| 44498.15625 | 30.39 |
| 44498.166666666664 | 30.41 |
| 44498.177083333336 | 30.46 |
| 44498.1875 | 30.48 |
| 44498.197916666664 | 30.48 |
| 44498.208333333336 | 30.52 |
| 44498.21875 | 30.53 |
| 44498.229166666664 | 30.56 |
| 44498.239583333336 | 30.59 |
| 44498.25 | 30.6 |
| 44498.260416666664 | 30.62 |
| 44498.270833333336 | 30.61 |
| 44498.28125 | 30.54 |
| 44498.291666666664 | 30.45 |
| 44498.302083333336 | 30.46 |
| 44498.3125 | 30.41 |
| 44498.322916666664 | 30.36 |
| 44498.333333333336 | 30.34 |
| 44498.34375 | 30.31 |
| 44498.354166666664 | 30.3 |
| 44498.364583333336 | 30.3 |
| 44498.375 | 30.28 |
| 44498.385416666664 | 30.28 |
| 44498.395833333336 | 30.25 |
| 44498.40625 | 30.24 |
| 44498.416666666664 | 30.24 |
| 44498.427083333336 | 30.22 |
| 44498.4375 | 30.2 |
| 44498.447916666664 | 30.2 |
| 44498.458333333336 | 30.18 |
| 44498.46875 | 30.16 |
| 44498.479166666664 | 30.12 |
| 44498.489583333336 | 30.08 |
| 44498.5 | 30.08 |
| 44498.510416666664 | 30.08 |
| 44498.520833333336 | 30.04 |
| 44498.53125 | 30.07 |
| 44498.541666666664 | 30.08 |
| 44498.552083333336 | 30.09 |
| 44498.5625 | 30.07 |
| 44498.572916666664 | 30.06 |
| 44498.583333333336 | 30.04 |
| 44498.59375 | 30.04 |
| 44498.604166666664 | 30.04 |
| 44498.614583333336 | 30.04 |
| 44498.625 | 30.02 |
| 44498.635416666664 | 30.02 |
| 44498.645833333336 | 30.01 |
| 44498.65625 | 30.04 |
| 44498.666666666664 | 30.08 |
| 44498.677083333336 | 30.12 |
| 44498.6875 | 30.11 |
| 44498.697916666664 | 30.09 |
| 44498.708333333336 | 30.15 |
| 44498.71875 | 30.13 |
| 44498.729166666664 | 30.13 |
| 44498.739583333336 | 30.1 |
| 44498.75 | 30.15 |
| 44498.760416666664 | 30.12 |
| 44498.770833333336 | 30.1 |
| 44498.78125 | 30.08 |
| 44498.791666666664 | 30.08 |
| 44498.802083333336 | 30.07 |
| 44498.8125 | 30.03 |
| 44498.822916666664 | 29.88 |
| 44498.833333333336 | 29.81 |
| 44498.84375 | 29.85 |
| 44498.854166666664 | 29.73 |
| 44498.864583333336 | 29.68 |
| 44498.875 | 29.68 |
| 44498.885416666664 | 29.72 |
| 44498.895833333336 | 29.7 |
| 44498.90625 | 29.83 |
| 44498.916666666664 | 29.84 |
| 44498.927083333336 | 29.76 |
| 44498.9375 | 29.72 |
| 44498.947916666664 | 29.7 |
| 44498.958333333336 | 29.65 |
| 44498.96875 | 29.64 |
| 44498.979166666664 | 29.64 |
| 44498.989583333336 | 29.67 |
| 44499.0 | 29.74 |
| 44499.010416666664 | 29.72 |
| 44499.020833333336 | 29.67 |
| 44499.03125 | 29.61 |
| 44499.041666666664 | 29.58 |
| 44499.052083333336 | 29.59 |
| 44499.0625 | 29.63 |
| 44499.072916666664 | 29.61 |
| 44499.083333333336 | 29.61 |
| 44499.09375 | 29.61 |
| 44499.104166666664 | 29.63 |
| 44499.114583333336 | 29.67 |
| 44499.125 | 29.69 |
| 44499.135416666664 | 29.69 |
| 44499.145833333336 | 29.67 |
| 44499.15625 | 29.69 |
| 44499.166666666664 | 29.69 |
| 44499.177083333336 | 29.73 |
| 44499.1875 | 29.76 |
| 44499.197916666664 | 29.79 |
| 44499.208333333336 | 29.85 |
| 44499.21875 | 29.9 |
| 44499.229166666664 | 29.9 |
| 44499.239583333336 | 29.9 |
| 44499.25 | 29.91 |
| 44499.260416666664 | 29.86 |
| 44499.270833333336 | 29.9 |
| 44499.28125 | 29.91 |
| 44499.291666666664 | 29.89 |
| 44499.302083333336 | 29.91 |
| 44499.3125 | 29.83 |
| 44499.322916666664 | 29.89 |
| 44499.333333333336 | 29.89 |
| 44499.34375 | 29.88 |
| 44499.354166666664 | 29.87 |
| 44499.364583333336 | 29.87 |
| 44499.375 | 29.87 |
| 44499.385416666664 | 29.87 |
| 44499.395833333336 | 29.87 |
| 44499.40625 | 29.87 |
| 44499.416666666664 | 29.87 |
| 44499.427083333336 | 29.88 |
| 44499.4375 | 29.87 |
| 44499.447916666664 | 29.88 |
| 44499.458333333336 | 29.82 |
| 44499.46875 | 29.81 |
| 44499.479166666664 | 29.82 |
| 44499.489583333336 | 29.82 |
| 44499.5 | 29.78 |
| 44499.510416666664 | 29.76 |
| 44499.520833333336 | 29.76 |
| 44499.53125 | 29.73 |
| 44499.541666666664 | 29.72 |
| 44499.552083333336 | 29.73 |
| 44499.5625 | 29.7 |
| 44499.572916666664 | 29.58 |
| 44499.583333333336 | 29.52 |
| 44499.59375 | 29.52 |
| 44499.604166666664 | 29.52 |
| 44499.614583333336 | 29.59 |
| 44499.625 | 29.63 |
| 44499.635416666664 | 29.65 |
| 44499.645833333336 | 29.72 |
| 44499.65625 | 29.77 |
| 44499.666666666664 | 29.81 |
| 44499.677083333336 | 29.94 |
| 44499.6875 | 29.91 |
| 44499.697916666664 | 29.92 |
| 44499.708333333336 | 29.94 |
| 44499.71875 | 29.95 |
| 44499.729166666664 | 29.96 |
| 44499.739583333336 | 29.96 |
| 44499.75 | 29.96 |
| 44499.760416666664 | 29.97 |
| 44499.770833333336 | 29.98 |
| 44499.78125 | 30 |
| 44499.791666666664 | 30.03 |
| 44499.802083333336 | 30.05 |
| 44499.8125 | 30.05 |
| 44499.822916666664 | 30.05 |
| 44499.833333333336 | 30.04 |
| 44499.84375 | 30.06 |
| 44499.854166666664 | 30.05 |
| 44499.864583333336 | 29.98 |
| 44499.875 | 30.04 |
| 44499.885416666664 | 30.02 |
| 44499.895833333336 | 30.03 |
| 44499.90625 | 30.02 |
| 44499.916666666664 | 30.04 |
| 44499.927083333336 | 30.04 |
| 44499.9375 | 30.03 |
| 44499.947916666664 | 30.02 |
| 44499.958333333336 | 30 |
| 44499.96875 | 30 |
| 44499.979166666664 | 29.99 |
| 44499.989583333336 | 29.98 |
| 44500.0 | 29.96 |
| 44500.010416666664 | 29.96 |
| 44500.020833333336 | 29.93 |
| 44500.03125 | 29.92 |
| 44500.041666666664 | 29.89 |
| 44500.052083333336 | 29.88 |
| 44500.0625 | 29.87 |
| 44500.072916666664 | 29.84 |
| 44500.083333333336 | 29.82 |
| 44500.09375 | 29.77 |
| 44500.104166666664 | 29.78 |
| 44500.114583333336 | 29.67 |
| 44500.125 | 29.5 |
| 44500.135416666664 | 29.48 |
| 44500.145833333336 | 29.47 |
| 44500.15625 | 29.48 |
| 44500.166666666664 | 29.53 |
| 44500.177083333336 | 29.56 |
| 44500.1875 | 29.55 |
| 44500.197916666664 | 29.61 |
| 44500.208333333336 | 29.72 |
| 44500.21875 | 29.79 |
| 44500.229166666664 | 29.84 |
| 44500.239583333336 | 29.94 |
| 44500.25 | 30.04 |
| 44500.260416666664 | 30.08 |
| 44500.270833333336 | 30.1 |
| 44500.28125 | 30.11 |
| 44500.291666666664 | 30.11 |
| 44500.302083333336 | 30.12 |
| 44500.3125 | 30.11 |
| 44500.322916666664 | 30.11 |
| 44500.333333333336 | 30.12 |
| 44500.34375 | 30.11 |
| 44500.354166666664 | 30.11 |
| 44500.364583333336 | 30.11 |
| 44500.375 | 30.11 |
| 44500.385416666664 | 30.11 |
| 44500.395833333336 | 30.11 |
| 44500.40625 | 30.07 |
| 44500.416666666664 | 30.08 |
| 44500.427083333336 | 30.08 |
| 44500.4375 | 30.06 |
| 44500.447916666664 | 30.09 |
| 44500.458333333336 | 30.07 |
| 44500.46875 | 30.06 |
| 44500.479166666664 | 30.06 |
| 44500.489583333336 | 30.05 |
| 44500.5 | 30.02 |
| 44500.510416666664 | 29.99 |
| 44500.520833333336 | 30 |
| 44500.53125 | 29.93 |
| 44500.541666666664 | 29.93 |
| 44500.552083333336 | 29.87 |
| 44500.5625 | 29.86 |
| 44500.572916666664 | 29.82 |
| 44500.583333333336 | 29.79 |
| 44500.59375 | 29.73 |
| 44500.604166666664 | 29.64 |
| 44500.614583333336 | 29.63 |
| 44500.625 | 29.31 |
| 44500.635416666664 | 29.25 |
| 44500.645833333336 | 29.24 |
| 44500.65625 | 29.25 |
| 44500.666666666664 | 29.38 |
| 44500.677083333336 | 29.43 |
| 44500.6875 | 29.46 |
| 44500.697916666664 | 29.52 |
| 44500.708333333336 | 29.64 |
| 44500.71875 | 29.71 |
| 44500.729166666664 | 29.83 |
| 44500.739583333336 | 29.96 |
| 44500.75 | 30.02 |
| 44500.760416666664 | 30.04 |
| 44500.770833333336 | 30.03 |
| 44500.78125 | 30.03 |
| 44500.791666666664 | 30.03 |
| 44500.802083333336 | 30.03 |
| 44500.8125 | 30.03 |
| 44500.822916666664 | 30.03 |
| 44500.833333333336 | 30.03 |
| 44500.84375 | 30.04 |
| 44500.854166666664 | 30.05 |
| 44500.864583333336 | 30.05 |
| 44500.875 | 30.06 |
| 44500.885416666664 | 30.07 |
| 44500.895833333336 | 30.08 |
| 44500.90625 | 30.1 |
| 44500.916666666664 | 30.1 |
| 44500.927083333336 | 30.03 |
| 44500.9375 | 30.07 |
| 44500.947916666664 | 30.06 |
| 44500.958333333336 | 30.04 |
| 44500.96875 | 30.06 |
| 44500.979166666664 | 30.06 |
| 44500.989583333336 | 30.06 |
| 44501.0 | 30.07 |
| 44501.010416666664 | 30.03 |
| 44501.020833333336 | 30.02 |
| 44501.03125 | 30 |
| 44501.041666666664 | 29.97 |
| 44501.052083333336 | 29.96 |
| 44501.0625 | 29.94 |
| 44501.072916666664 | 29.93 |
| 44501.083333333336 | 29.9 |
| 44501.09375 | 29.82 |
| 44501.104166666664 | 29.71 |
| 44501.114583333336 | 29.53 |
| 44501.125 | 29.41 |
| 44501.135416666664 | 29.23 |
| 44501.145833333336 | 29.22 |
| 44501.15625 | 29.14 |